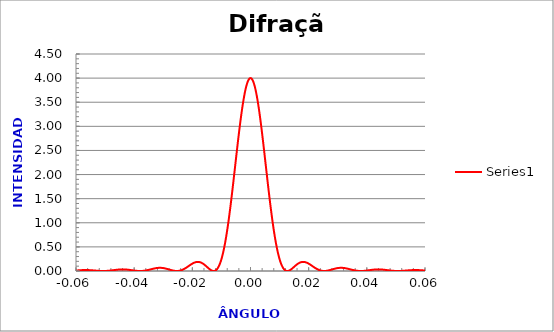
| Category | Series 0 |
|---|---|
| -0.1 | 0.001 |
| -0.09995 | 0.001 |
| -0.0999 | 0.001 |
| -0.09985 | 0.001 |
| -0.0998 | 0.001 |
| -0.09975 | 0.001 |
| -0.0997 | 0.001 |
| -0.0996499999999999 | 0.001 |
| -0.0995999999999999 | 0.001 |
| -0.0995499999999999 | 0.001 |
| -0.0994999999999999 | 0.001 |
| -0.0994499999999999 | 0.001 |
| -0.0993999999999999 | 0.002 |
| -0.0993499999999999 | 0.002 |
| -0.0992999999999999 | 0.002 |
| -0.0992499999999999 | 0.002 |
| -0.0991999999999999 | 0.002 |
| -0.0991499999999999 | 0.002 |
| -0.0990999999999999 | 0.002 |
| -0.0990499999999998 | 0.002 |
| -0.0989999999999998 | 0.002 |
| -0.0989499999999998 | 0.002 |
| -0.0988999999999998 | 0.002 |
| -0.0988499999999998 | 0.002 |
| -0.0987999999999998 | 0.002 |
| -0.0987499999999998 | 0.003 |
| -0.0986999999999998 | 0.003 |
| -0.0986499999999998 | 0.003 |
| -0.0985999999999998 | 0.003 |
| -0.0985499999999998 | 0.003 |
| -0.0984999999999998 | 0.003 |
| -0.0984499999999997 | 0.003 |
| -0.0983999999999997 | 0.003 |
| -0.0983499999999997 | 0.003 |
| -0.0982999999999997 | 0.003 |
| -0.0982499999999997 | 0.003 |
| -0.0981999999999997 | 0.004 |
| -0.0981499999999997 | 0.004 |
| -0.0980999999999997 | 0.004 |
| -0.0980499999999997 | 0.004 |
| -0.0979999999999997 | 0.004 |
| -0.0979499999999997 | 0.004 |
| -0.0978999999999997 | 0.004 |
| -0.0978499999999996 | 0.004 |
| -0.0977999999999996 | 0.004 |
| -0.0977499999999996 | 0.004 |
| -0.0976999999999996 | 0.004 |
| -0.0976499999999996 | 0.004 |
| -0.0975999999999996 | 0.005 |
| -0.0975499999999996 | 0.005 |
| -0.0974999999999996 | 0.005 |
| -0.0974499999999996 | 0.005 |
| -0.0973999999999996 | 0.005 |
| -0.0973499999999996 | 0.005 |
| -0.0972999999999996 | 0.005 |
| -0.0972499999999995 | 0.005 |
| -0.0971999999999995 | 0.005 |
| -0.0971499999999995 | 0.005 |
| -0.0970999999999995 | 0.005 |
| -0.0970499999999995 | 0.005 |
| -0.0969999999999995 | 0.005 |
| -0.0969499999999995 | 0.006 |
| -0.0968999999999995 | 0.006 |
| -0.0968499999999995 | 0.006 |
| -0.0967999999999995 | 0.006 |
| -0.0967499999999995 | 0.006 |
| -0.0966999999999995 | 0.006 |
| -0.0966499999999994 | 0.006 |
| -0.0965999999999994 | 0.006 |
| -0.0965499999999994 | 0.006 |
| -0.0964999999999994 | 0.006 |
| -0.0964499999999994 | 0.006 |
| -0.0963999999999994 | 0.006 |
| -0.0963499999999994 | 0.006 |
| -0.0962999999999994 | 0.006 |
| -0.0962499999999994 | 0.006 |
| -0.0961999999999994 | 0.007 |
| -0.0961499999999994 | 0.007 |
| -0.0960999999999994 | 0.007 |
| -0.0960499999999993 | 0.007 |
| -0.0959999999999993 | 0.007 |
| -0.0959499999999993 | 0.007 |
| -0.0958999999999993 | 0.007 |
| -0.0958499999999993 | 0.007 |
| -0.0957999999999993 | 0.007 |
| -0.0957499999999993 | 0.007 |
| -0.0956999999999993 | 0.007 |
| -0.0956499999999993 | 0.007 |
| -0.0955999999999993 | 0.007 |
| -0.0955499999999993 | 0.007 |
| -0.0954999999999993 | 0.007 |
| -0.0954499999999992 | 0.007 |
| -0.0953999999999992 | 0.007 |
| -0.0953499999999992 | 0.007 |
| -0.0952999999999992 | 0.007 |
| -0.0952499999999992 | 0.007 |
| -0.0951999999999992 | 0.007 |
| -0.0951499999999992 | 0.007 |
| -0.0950999999999992 | 0.007 |
| -0.0950499999999992 | 0.007 |
| -0.0949999999999992 | 0.007 |
| -0.0949499999999992 | 0.007 |
| -0.0948999999999992 | 0.007 |
| -0.0948499999999991 | 0.007 |
| -0.0947999999999991 | 0.007 |
| -0.0947499999999991 | 0.007 |
| -0.0946999999999991 | 0.007 |
| -0.0946499999999991 | 0.007 |
| -0.0945999999999991 | 0.007 |
| -0.0945499999999991 | 0.007 |
| -0.0944999999999991 | 0.007 |
| -0.0944499999999991 | 0.007 |
| -0.0943999999999991 | 0.007 |
| -0.0943499999999991 | 0.007 |
| -0.0942999999999991 | 0.007 |
| -0.094249999999999 | 0.007 |
| -0.094199999999999 | 0.007 |
| -0.094149999999999 | 0.007 |
| -0.094099999999999 | 0.007 |
| -0.094049999999999 | 0.007 |
| -0.093999999999999 | 0.007 |
| -0.093949999999999 | 0.007 |
| -0.093899999999999 | 0.007 |
| -0.093849999999999 | 0.007 |
| -0.093799999999999 | 0.007 |
| -0.093749999999999 | 0.007 |
| -0.093699999999999 | 0.007 |
| -0.0936499999999989 | 0.007 |
| -0.0935999999999989 | 0.006 |
| -0.0935499999999989 | 0.006 |
| -0.0934999999999989 | 0.006 |
| -0.0934499999999989 | 0.006 |
| -0.0933999999999989 | 0.006 |
| -0.0933499999999989 | 0.006 |
| -0.0932999999999989 | 0.006 |
| -0.0932499999999989 | 0.006 |
| -0.0931999999999989 | 0.006 |
| -0.0931499999999989 | 0.006 |
| -0.0930999999999989 | 0.006 |
| -0.0930499999999988 | 0.006 |
| -0.0929999999999988 | 0.006 |
| -0.0929499999999988 | 0.006 |
| -0.0928999999999988 | 0.006 |
| -0.0928499999999988 | 0.005 |
| -0.0927999999999988 | 0.005 |
| -0.0927499999999988 | 0.005 |
| -0.0926999999999988 | 0.005 |
| -0.0926499999999988 | 0.005 |
| -0.0925999999999988 | 0.005 |
| -0.0925499999999988 | 0.005 |
| -0.0924999999999987 | 0.005 |
| -0.0924499999999987 | 0.005 |
| -0.0923999999999987 | 0.005 |
| -0.0923499999999987 | 0.005 |
| -0.0922999999999987 | 0.005 |
| -0.0922499999999987 | 0.004 |
| -0.0921999999999987 | 0.004 |
| -0.0921499999999987 | 0.004 |
| -0.0920999999999987 | 0.004 |
| -0.0920499999999987 | 0.004 |
| -0.0919999999999987 | 0.004 |
| -0.0919499999999987 | 0.004 |
| -0.0918999999999986 | 0.004 |
| -0.0918499999999986 | 0.004 |
| -0.0917999999999986 | 0.004 |
| -0.0917499999999986 | 0.004 |
| -0.0916999999999986 | 0.003 |
| -0.0916499999999986 | 0.003 |
| -0.0915999999999986 | 0.003 |
| -0.0915499999999986 | 0.003 |
| -0.0914999999999986 | 0.003 |
| -0.0914499999999986 | 0.003 |
| -0.0913999999999986 | 0.003 |
| -0.0913499999999986 | 0.003 |
| -0.0912999999999985 | 0.003 |
| -0.0912499999999985 | 0.003 |
| -0.0911999999999985 | 0.003 |
| -0.0911499999999985 | 0.002 |
| -0.0910999999999985 | 0.002 |
| -0.0910499999999985 | 0.002 |
| -0.0909999999999985 | 0.002 |
| -0.0909499999999985 | 0.002 |
| -0.0908999999999985 | 0.002 |
| -0.0908499999999985 | 0.002 |
| -0.0907999999999985 | 0.002 |
| -0.0907499999999985 | 0.002 |
| -0.0906999999999984 | 0.002 |
| -0.0906499999999984 | 0.002 |
| -0.0905999999999984 | 0.002 |
| -0.0905499999999984 | 0.001 |
| -0.0904999999999984 | 0.001 |
| -0.0904499999999984 | 0.001 |
| -0.0903999999999984 | 0.001 |
| -0.0903499999999984 | 0.001 |
| -0.0902999999999984 | 0.001 |
| -0.0902499999999984 | 0.001 |
| -0.0901999999999984 | 0.001 |
| -0.0901499999999984 | 0.001 |
| -0.0900999999999983 | 0.001 |
| -0.0900499999999983 | 0.001 |
| -0.0899999999999983 | 0.001 |
| -0.0899499999999983 | 0.001 |
| -0.0898999999999983 | 0.001 |
| -0.0898499999999983 | 0.001 |
| -0.0897999999999983 | 0.001 |
| -0.0897499999999983 | 0 |
| -0.0896999999999983 | 0 |
| -0.0896499999999983 | 0 |
| -0.0895999999999983 | 0 |
| -0.0895499999999983 | 0 |
| -0.0894999999999982 | 0 |
| -0.0894499999999982 | 0 |
| -0.0893999999999982 | 0 |
| -0.0893499999999982 | 0 |
| -0.0892999999999982 | 0 |
| -0.0892499999999982 | 0 |
| -0.0891999999999982 | 0 |
| -0.0891499999999982 | 0 |
| -0.0890999999999982 | 0 |
| -0.0890499999999982 | 0 |
| -0.0889999999999982 | 0 |
| -0.0889499999999981 | 0 |
| -0.0888999999999981 | 0 |
| -0.0888499999999981 | 0 |
| -0.0887999999999981 | 0 |
| -0.0887499999999981 | 0 |
| -0.0886999999999981 | 0 |
| -0.0886499999999981 | 0 |
| -0.0885999999999981 | 0 |
| -0.0885499999999981 | 0 |
| -0.0884999999999981 | 0 |
| -0.0884499999999981 | 0 |
| -0.0883999999999981 | 0 |
| -0.088349999999998 | 0 |
| -0.088299999999998 | 0 |
| -0.088249999999998 | 0 |
| -0.088199999999998 | 0 |
| -0.088149999999998 | 0 |
| -0.088099999999998 | 0 |
| -0.088049999999998 | 0 |
| -0.087999999999998 | 0 |
| -0.087949999999998 | 0 |
| -0.087899999999998 | 0 |
| -0.087849999999998 | 0 |
| -0.087799999999998 | 0 |
| -0.0877499999999979 | 0 |
| -0.0876999999999979 | 0.001 |
| -0.0876499999999979 | 0.001 |
| -0.0875999999999979 | 0.001 |
| -0.0875499999999979 | 0.001 |
| -0.0874999999999979 | 0.001 |
| -0.0874499999999979 | 0.001 |
| -0.0873999999999979 | 0.001 |
| -0.0873499999999979 | 0.001 |
| -0.0872999999999979 | 0.001 |
| -0.0872499999999979 | 0.001 |
| -0.0871999999999979 | 0.001 |
| -0.0871499999999978 | 0.001 |
| -0.0870999999999978 | 0.001 |
| -0.0870499999999978 | 0.001 |
| -0.0869999999999978 | 0.001 |
| -0.0869499999999978 | 0.002 |
| -0.0868999999999978 | 0.002 |
| -0.0868499999999978 | 0.002 |
| -0.0867999999999978 | 0.002 |
| -0.0867499999999978 | 0.002 |
| -0.0866999999999978 | 0.002 |
| -0.0866499999999978 | 0.002 |
| -0.0865999999999978 | 0.002 |
| -0.0865499999999977 | 0.002 |
| -0.0864999999999977 | 0.002 |
| -0.0864499999999977 | 0.002 |
| -0.0863999999999977 | 0.003 |
| -0.0863499999999977 | 0.003 |
| -0.0862999999999977 | 0.003 |
| -0.0862499999999977 | 0.003 |
| -0.0861999999999977 | 0.003 |
| -0.0861499999999977 | 0.003 |
| -0.0860999999999977 | 0.003 |
| -0.0860499999999977 | 0.003 |
| -0.0859999999999977 | 0.003 |
| -0.0859499999999976 | 0.004 |
| -0.0858999999999976 | 0.004 |
| -0.0858499999999976 | 0.004 |
| -0.0857999999999976 | 0.004 |
| -0.0857499999999976 | 0.004 |
| -0.0856999999999976 | 0.004 |
| -0.0856499999999976 | 0.004 |
| -0.0855999999999976 | 0.004 |
| -0.0855499999999976 | 0.004 |
| -0.0854999999999976 | 0.005 |
| -0.0854499999999976 | 0.005 |
| -0.0853999999999976 | 0.005 |
| -0.0853499999999975 | 0.005 |
| -0.0852999999999975 | 0.005 |
| -0.0852499999999975 | 0.005 |
| -0.0851999999999975 | 0.005 |
| -0.0851499999999975 | 0.005 |
| -0.0850999999999975 | 0.006 |
| -0.0850499999999975 | 0.006 |
| -0.0849999999999975 | 0.006 |
| -0.0849499999999975 | 0.006 |
| -0.0848999999999975 | 0.006 |
| -0.0848499999999975 | 0.006 |
| -0.0847999999999975 | 0.006 |
| -0.0847499999999974 | 0.006 |
| -0.0846999999999974 | 0.006 |
| -0.0846499999999974 | 0.007 |
| -0.0845999999999974 | 0.007 |
| -0.0845499999999974 | 0.007 |
| -0.0844999999999974 | 0.007 |
| -0.0844499999999974 | 0.007 |
| -0.0843999999999974 | 0.007 |
| -0.0843499999999974 | 0.007 |
| -0.0842999999999974 | 0.007 |
| -0.0842499999999974 | 0.007 |
| -0.0841999999999974 | 0.007 |
| -0.0841499999999973 | 0.008 |
| -0.0840999999999973 | 0.008 |
| -0.0840499999999973 | 0.008 |
| -0.0839999999999973 | 0.008 |
| -0.0839499999999973 | 0.008 |
| -0.0838999999999973 | 0.008 |
| -0.0838499999999973 | 0.008 |
| -0.0837999999999973 | 0.008 |
| -0.0837499999999973 | 0.008 |
| -0.0836999999999973 | 0.008 |
| -0.0836499999999973 | 0.008 |
| -0.0835999999999973 | 0.008 |
| -0.0835499999999972 | 0.009 |
| -0.0834999999999972 | 0.009 |
| -0.0834499999999972 | 0.009 |
| -0.0833999999999972 | 0.009 |
| -0.0833499999999972 | 0.009 |
| -0.0832999999999972 | 0.009 |
| -0.0832499999999972 | 0.009 |
| -0.0831999999999972 | 0.009 |
| -0.0831499999999972 | 0.009 |
| -0.0830999999999972 | 0.009 |
| -0.0830499999999972 | 0.009 |
| -0.0829999999999972 | 0.009 |
| -0.0829499999999971 | 0.009 |
| -0.0828999999999971 | 0.009 |
| -0.0828499999999971 | 0.009 |
| -0.0827999999999971 | 0.009 |
| -0.0827499999999971 | 0.009 |
| -0.0826999999999971 | 0.009 |
| -0.0826499999999971 | 0.009 |
| -0.0825999999999971 | 0.01 |
| -0.0825499999999971 | 0.01 |
| -0.0824999999999971 | 0.01 |
| -0.0824499999999971 | 0.01 |
| -0.0823999999999971 | 0.01 |
| -0.082349999999997 | 0.01 |
| -0.082299999999997 | 0.01 |
| -0.082249999999997 | 0.01 |
| -0.082199999999997 | 0.01 |
| -0.082149999999997 | 0.01 |
| -0.082099999999997 | 0.01 |
| -0.082049999999997 | 0.01 |
| -0.081999999999997 | 0.01 |
| -0.081949999999997 | 0.01 |
| -0.081899999999997 | 0.01 |
| -0.081849999999997 | 0.01 |
| -0.081799999999997 | 0.01 |
| -0.0817499999999969 | 0.01 |
| -0.0816999999999969 | 0.009 |
| -0.0816499999999969 | 0.009 |
| -0.0815999999999969 | 0.009 |
| -0.0815499999999969 | 0.009 |
| -0.0814999999999969 | 0.009 |
| -0.0814499999999969 | 0.009 |
| -0.0813999999999969 | 0.009 |
| -0.0813499999999969 | 0.009 |
| -0.0812999999999969 | 0.009 |
| -0.0812499999999969 | 0.009 |
| -0.0811999999999969 | 0.009 |
| -0.0811499999999968 | 0.009 |
| -0.0810999999999968 | 0.009 |
| -0.0810499999999968 | 0.009 |
| -0.0809999999999968 | 0.009 |
| -0.0809499999999968 | 0.009 |
| -0.0808999999999968 | 0.009 |
| -0.0808499999999968 | 0.009 |
| -0.0807999999999968 | 0.009 |
| -0.0807499999999968 | 0.008 |
| -0.0806999999999968 | 0.008 |
| -0.0806499999999968 | 0.008 |
| -0.0805999999999968 | 0.008 |
| -0.0805499999999967 | 0.008 |
| -0.0804999999999967 | 0.008 |
| -0.0804499999999967 | 0.008 |
| -0.0803999999999967 | 0.008 |
| -0.0803499999999967 | 0.008 |
| -0.0802999999999967 | 0.008 |
| -0.0802499999999967 | 0.008 |
| -0.0801999999999967 | 0.007 |
| -0.0801499999999967 | 0.007 |
| -0.0800999999999967 | 0.007 |
| -0.0800499999999967 | 0.007 |
| -0.0799999999999967 | 0.007 |
| -0.0799499999999966 | 0.007 |
| -0.0798999999999966 | 0.007 |
| -0.0798499999999966 | 0.007 |
| -0.0797999999999966 | 0.007 |
| -0.0797499999999966 | 0.006 |
| -0.0796999999999966 | 0.006 |
| -0.0796499999999966 | 0.006 |
| -0.0795999999999966 | 0.006 |
| -0.0795499999999966 | 0.006 |
| -0.0794999999999966 | 0.006 |
| -0.0794499999999966 | 0.006 |
| -0.0793999999999966 | 0.006 |
| -0.0793499999999965 | 0.006 |
| -0.0792999999999965 | 0.005 |
| -0.0792499999999965 | 0.005 |
| -0.0791999999999965 | 0.005 |
| -0.0791499999999965 | 0.005 |
| -0.0790999999999965 | 0.005 |
| -0.0790499999999965 | 0.005 |
| -0.0789999999999965 | 0.005 |
| -0.0789499999999965 | 0.005 |
| -0.0788999999999965 | 0.004 |
| -0.0788499999999965 | 0.004 |
| -0.0787999999999965 | 0.004 |
| -0.0787499999999964 | 0.004 |
| -0.0786999999999964 | 0.004 |
| -0.0786499999999964 | 0.004 |
| -0.0785999999999964 | 0.004 |
| -0.0785499999999964 | 0.004 |
| -0.0784999999999964 | 0.003 |
| -0.0784499999999964 | 0.003 |
| -0.0783999999999964 | 0.003 |
| -0.0783499999999964 | 0.003 |
| -0.0782999999999964 | 0.003 |
| -0.0782499999999964 | 0.003 |
| -0.0781999999999964 | 0.003 |
| -0.0781499999999963 | 0.003 |
| -0.0780999999999963 | 0.003 |
| -0.0780499999999963 | 0.002 |
| -0.0779999999999963 | 0.002 |
| -0.0779499999999963 | 0.002 |
| -0.0778999999999963 | 0.002 |
| -0.0778499999999963 | 0.002 |
| -0.0777999999999963 | 0.002 |
| -0.0777499999999963 | 0.002 |
| -0.0776999999999963 | 0.002 |
| -0.0776499999999963 | 0.002 |
| -0.0775999999999962 | 0.002 |
| -0.0775499999999962 | 0.001 |
| -0.0774999999999962 | 0.001 |
| -0.0774499999999962 | 0.001 |
| -0.0773999999999962 | 0.001 |
| -0.0773499999999962 | 0.001 |
| -0.0772999999999962 | 0.001 |
| -0.0772499999999962 | 0.001 |
| -0.0771999999999962 | 0.001 |
| -0.0771499999999962 | 0.001 |
| -0.0770999999999962 | 0.001 |
| -0.0770499999999962 | 0.001 |
| -0.0769999999999961 | 0.001 |
| -0.0769499999999961 | 0.001 |
| -0.0768999999999961 | 0 |
| -0.0768499999999961 | 0 |
| -0.0767999999999961 | 0 |
| -0.0767499999999961 | 0 |
| -0.0766999999999961 | 0 |
| -0.0766499999999961 | 0 |
| -0.0765999999999961 | 0 |
| -0.0765499999999961 | 0 |
| -0.0764999999999961 | 0 |
| -0.0764499999999961 | 0 |
| -0.076399999999996 | 0 |
| -0.076349999999996 | 0 |
| -0.076299999999996 | 0 |
| -0.076249999999996 | 0 |
| -0.076199999999996 | 0 |
| -0.076149999999996 | 0 |
| -0.076099999999996 | 0 |
| -0.076049999999996 | 0 |
| -0.075999999999996 | 0 |
| -0.075949999999996 | 0 |
| -0.075899999999996 | 0 |
| -0.075849999999996 | 0 |
| -0.0757999999999959 | 0 |
| -0.0757499999999959 | 0 |
| -0.0756999999999959 | 0 |
| -0.0756499999999959 | 0 |
| -0.0755999999999959 | 0 |
| -0.0755499999999959 | 0 |
| -0.0754999999999959 | 0 |
| -0.0754499999999959 | 0 |
| -0.0753999999999959 | 0 |
| -0.0753499999999959 | 0 |
| -0.0752999999999959 | 0 |
| -0.0752499999999959 | 0 |
| -0.0751999999999958 | 0 |
| -0.0751499999999958 | 0.001 |
| -0.0750999999999958 | 0.001 |
| -0.0750499999999958 | 0.001 |
| -0.0749999999999958 | 0.001 |
| -0.0749499999999958 | 0.001 |
| -0.0748999999999958 | 0.001 |
| -0.0748499999999958 | 0.001 |
| -0.0747999999999958 | 0.001 |
| -0.0747499999999958 | 0.001 |
| -0.0746999999999958 | 0.001 |
| -0.0746499999999958 | 0.001 |
| -0.0745999999999957 | 0.001 |
| -0.0745499999999957 | 0.002 |
| -0.0744999999999957 | 0.002 |
| -0.0744499999999957 | 0.002 |
| -0.0743999999999957 | 0.002 |
| -0.0743499999999957 | 0.002 |
| -0.0742999999999957 | 0.002 |
| -0.0742499999999957 | 0.002 |
| -0.0741999999999957 | 0.002 |
| -0.0741499999999957 | 0.002 |
| -0.0740999999999957 | 0.003 |
| -0.0740499999999957 | 0.003 |
| -0.0739999999999956 | 0.003 |
| -0.0739499999999956 | 0.003 |
| -0.0738999999999956 | 0.003 |
| -0.0738499999999956 | 0.003 |
| -0.0737999999999956 | 0.003 |
| -0.0737499999999956 | 0.003 |
| -0.0736999999999956 | 0.004 |
| -0.0736499999999956 | 0.004 |
| -0.0735999999999956 | 0.004 |
| -0.0735499999999956 | 0.004 |
| -0.0734999999999956 | 0.004 |
| -0.0734499999999956 | 0.004 |
| -0.0733999999999955 | 0.004 |
| -0.0733499999999955 | 0.005 |
| -0.0732999999999955 | 0.005 |
| -0.0732499999999955 | 0.005 |
| -0.0731999999999955 | 0.005 |
| -0.0731499999999955 | 0.005 |
| -0.0730999999999955 | 0.005 |
| -0.0730499999999955 | 0.006 |
| -0.0729999999999955 | 0.006 |
| -0.0729499999999955 | 0.006 |
| -0.0728999999999955 | 0.006 |
| -0.0728499999999955 | 0.006 |
| -0.0727999999999954 | 0.006 |
| -0.0727499999999954 | 0.006 |
| -0.0726999999999954 | 0.007 |
| -0.0726499999999954 | 0.007 |
| -0.0725999999999954 | 0.007 |
| -0.0725499999999954 | 0.007 |
| -0.0724999999999954 | 0.007 |
| -0.0724499999999954 | 0.007 |
| -0.0723999999999954 | 0.008 |
| -0.0723499999999954 | 0.008 |
| -0.0722999999999954 | 0.008 |
| -0.0722499999999954 | 0.008 |
| -0.0721999999999953 | 0.008 |
| -0.0721499999999953 | 0.008 |
| -0.0720999999999953 | 0.009 |
| -0.0720499999999953 | 0.009 |
| -0.0719999999999953 | 0.009 |
| -0.0719499999999953 | 0.009 |
| -0.0718999999999953 | 0.009 |
| -0.0718499999999953 | 0.009 |
| -0.0717999999999953 | 0.009 |
| -0.0717499999999953 | 0.01 |
| -0.0716999999999953 | 0.01 |
| -0.0716499999999953 | 0.01 |
| -0.0715999999999952 | 0.01 |
| -0.0715499999999952 | 0.01 |
| -0.0714999999999952 | 0.01 |
| -0.0714499999999952 | 0.01 |
| -0.0713999999999952 | 0.011 |
| -0.0713499999999952 | 0.011 |
| -0.0712999999999952 | 0.011 |
| -0.0712499999999952 | 0.011 |
| -0.0711999999999952 | 0.011 |
| -0.0711499999999952 | 0.011 |
| -0.0710999999999952 | 0.011 |
| -0.0710499999999952 | 0.011 |
| -0.0709999999999951 | 0.012 |
| -0.0709499999999951 | 0.012 |
| -0.0708999999999951 | 0.012 |
| -0.0708499999999951 | 0.012 |
| -0.0707999999999951 | 0.012 |
| -0.0707499999999951 | 0.012 |
| -0.0706999999999951 | 0.012 |
| -0.0706499999999951 | 0.012 |
| -0.0705999999999951 | 0.012 |
| -0.0705499999999951 | 0.012 |
| -0.0704999999999951 | 0.013 |
| -0.0704499999999951 | 0.013 |
| -0.070399999999995 | 0.013 |
| -0.070349999999995 | 0.013 |
| -0.070299999999995 | 0.013 |
| -0.070249999999995 | 0.013 |
| -0.070199999999995 | 0.013 |
| -0.070149999999995 | 0.013 |
| -0.070099999999995 | 0.013 |
| -0.070049999999995 | 0.013 |
| -0.069999999999995 | 0.013 |
| -0.069949999999995 | 0.013 |
| -0.069899999999995 | 0.013 |
| -0.069849999999995 | 0.013 |
| -0.0697999999999949 | 0.013 |
| -0.0697499999999949 | 0.013 |
| -0.0696999999999949 | 0.013 |
| -0.0696499999999949 | 0.013 |
| -0.0695999999999949 | 0.013 |
| -0.0695499999999949 | 0.013 |
| -0.0694999999999949 | 0.013 |
| -0.0694499999999949 | 0.013 |
| -0.0693999999999949 | 0.013 |
| -0.0693499999999949 | 0.013 |
| -0.0692999999999949 | 0.013 |
| -0.0692499999999949 | 0.013 |
| -0.0691999999999948 | 0.013 |
| -0.0691499999999948 | 0.013 |
| -0.0690999999999948 | 0.013 |
| -0.0690499999999948 | 0.013 |
| -0.0689999999999948 | 0.013 |
| -0.0689499999999948 | 0.013 |
| -0.0688999999999948 | 0.013 |
| -0.0688499999999948 | 0.013 |
| -0.0687999999999948 | 0.013 |
| -0.0687499999999948 | 0.013 |
| -0.0686999999999948 | 0.013 |
| -0.0686499999999948 | 0.013 |
| -0.0685999999999947 | 0.013 |
| -0.0685499999999947 | 0.013 |
| -0.0684999999999947 | 0.013 |
| -0.0684499999999947 | 0.013 |
| -0.0683999999999947 | 0.013 |
| -0.0683499999999947 | 0.012 |
| -0.0682999999999947 | 0.012 |
| -0.0682499999999947 | 0.012 |
| -0.0681999999999947 | 0.012 |
| -0.0681499999999947 | 0.012 |
| -0.0680999999999947 | 0.012 |
| -0.0680499999999947 | 0.012 |
| -0.0679999999999946 | 0.012 |
| -0.0679499999999946 | 0.012 |
| -0.0678999999999946 | 0.012 |
| -0.0678499999999946 | 0.011 |
| -0.0677999999999946 | 0.011 |
| -0.0677499999999946 | 0.011 |
| -0.0676999999999946 | 0.011 |
| -0.0676499999999946 | 0.011 |
| -0.0675999999999946 | 0.011 |
| -0.0675499999999946 | 0.011 |
| -0.0674999999999946 | 0.01 |
| -0.0674499999999946 | 0.01 |
| -0.0673999999999945 | 0.01 |
| -0.0673499999999945 | 0.01 |
| -0.0672999999999945 | 0.01 |
| -0.0672499999999945 | 0.01 |
| -0.0671999999999945 | 0.01 |
| -0.0671499999999945 | 0.009 |
| -0.0670999999999945 | 0.009 |
| -0.0670499999999945 | 0.009 |
| -0.0669999999999945 | 0.009 |
| -0.0669499999999945 | 0.009 |
| -0.0668999999999945 | 0.009 |
| -0.0668499999999944 | 0.008 |
| -0.0667999999999944 | 0.008 |
| -0.0667499999999944 | 0.008 |
| -0.0666999999999944 | 0.008 |
| -0.0666499999999944 | 0.008 |
| -0.0665999999999944 | 0.008 |
| -0.0665499999999944 | 0.007 |
| -0.0664999999999944 | 0.007 |
| -0.0664499999999944 | 0.007 |
| -0.0663999999999944 | 0.007 |
| -0.0663499999999944 | 0.007 |
| -0.0662999999999944 | 0.007 |
| -0.0662499999999943 | 0.006 |
| -0.0661999999999943 | 0.006 |
| -0.0661499999999943 | 0.006 |
| -0.0660999999999943 | 0.006 |
| -0.0660499999999943 | 0.006 |
| -0.0659999999999943 | 0.006 |
| -0.0659499999999943 | 0.005 |
| -0.0658999999999943 | 0.005 |
| -0.0658499999999943 | 0.005 |
| -0.0657999999999943 | 0.005 |
| -0.0657499999999943 | 0.005 |
| -0.0656999999999943 | 0.005 |
| -0.0656499999999942 | 0.004 |
| -0.0655999999999942 | 0.004 |
| -0.0655499999999942 | 0.004 |
| -0.0654999999999942 | 0.004 |
| -0.0654499999999942 | 0.004 |
| -0.0653999999999942 | 0.004 |
| -0.0653499999999942 | 0.003 |
| -0.0652999999999942 | 0.003 |
| -0.0652499999999942 | 0.003 |
| -0.0651999999999942 | 0.003 |
| -0.0651499999999942 | 0.003 |
| -0.0650999999999942 | 0.003 |
| -0.0650499999999941 | 0.003 |
| -0.0649999999999941 | 0.002 |
| -0.0649499999999941 | 0.002 |
| -0.0648999999999941 | 0.002 |
| -0.0648499999999941 | 0.002 |
| -0.0647999999999941 | 0.002 |
| -0.0647499999999941 | 0.002 |
| -0.0646999999999941 | 0.002 |
| -0.0646499999999941 | 0.002 |
| -0.0645999999999941 | 0.001 |
| -0.0645499999999941 | 0.001 |
| -0.0644999999999941 | 0.001 |
| -0.064449999999994 | 0.001 |
| -0.064399999999994 | 0.001 |
| -0.064349999999994 | 0.001 |
| -0.064299999999994 | 0.001 |
| -0.064249999999994 | 0.001 |
| -0.064199999999994 | 0.001 |
| -0.064149999999994 | 0.001 |
| -0.064099999999994 | 0.001 |
| -0.064049999999994 | 0 |
| -0.063999999999994 | 0 |
| -0.063949999999994 | 0 |
| -0.063899999999994 | 0 |
| -0.0638499999999939 | 0 |
| -0.0637999999999939 | 0 |
| -0.0637499999999939 | 0 |
| -0.0636999999999939 | 0 |
| -0.0636499999999939 | 0 |
| -0.0635999999999939 | 0 |
| -0.0635499999999939 | 0 |
| -0.0634999999999939 | 0 |
| -0.0634499999999939 | 0 |
| -0.0633999999999939 | 0 |
| -0.0633499999999939 | 0 |
| -0.0632999999999939 | 0 |
| -0.0632499999999938 | 0 |
| -0.0631999999999938 | 0 |
| -0.0631499999999938 | 0 |
| -0.0630999999999938 | 0 |
| -0.0630499999999938 | 0 |
| -0.0629999999999938 | 0 |
| -0.0629499999999938 | 0 |
| -0.0628999999999938 | 0 |
| -0.0628499999999938 | 0 |
| -0.0627999999999938 | 0 |
| -0.0627499999999938 | 0 |
| -0.0626999999999938 | 0 |
| -0.0626499999999937 | 0 |
| -0.0625999999999937 | 0.001 |
| -0.0625499999999937 | 0.001 |
| -0.0624999999999937 | 0.001 |
| -0.0624499999999937 | 0.001 |
| -0.0623999999999937 | 0.001 |
| -0.0623499999999937 | 0.001 |
| -0.0622999999999937 | 0.001 |
| -0.0622499999999937 | 0.001 |
| -0.0621999999999937 | 0.001 |
| -0.0621499999999937 | 0.001 |
| -0.0620999999999937 | 0.002 |
| -0.0620499999999936 | 0.002 |
| -0.0619999999999936 | 0.002 |
| -0.0619499999999936 | 0.002 |
| -0.0618999999999936 | 0.002 |
| -0.0618499999999936 | 0.002 |
| -0.0617999999999936 | 0.002 |
| -0.0617499999999936 | 0.003 |
| -0.0616999999999936 | 0.003 |
| -0.0616499999999936 | 0.003 |
| -0.0615999999999936 | 0.003 |
| -0.0615499999999936 | 0.003 |
| -0.0614999999999936 | 0.003 |
| -0.0614499999999935 | 0.004 |
| -0.0613999999999935 | 0.004 |
| -0.0613499999999935 | 0.004 |
| -0.0612999999999935 | 0.004 |
| -0.0612499999999935 | 0.004 |
| -0.0611999999999935 | 0.004 |
| -0.0611499999999935 | 0.005 |
| -0.0610999999999935 | 0.005 |
| -0.0610499999999935 | 0.005 |
| -0.0609999999999935 | 0.005 |
| -0.0609499999999935 | 0.005 |
| -0.0608999999999935 | 0.006 |
| -0.0608499999999934 | 0.006 |
| -0.0607999999999934 | 0.006 |
| -0.0607499999999934 | 0.006 |
| -0.0606999999999934 | 0.007 |
| -0.0606499999999934 | 0.007 |
| -0.0605999999999934 | 0.007 |
| -0.0605499999999934 | 0.007 |
| -0.0604999999999934 | 0.007 |
| -0.0604499999999934 | 0.008 |
| -0.0603999999999934 | 0.008 |
| -0.0603499999999934 | 0.008 |
| -0.0602999999999934 | 0.008 |
| -0.0602499999999933 | 0.009 |
| -0.0601999999999933 | 0.009 |
| -0.0601499999999933 | 0.009 |
| -0.0600999999999933 | 0.009 |
| -0.0600499999999933 | 0.01 |
| -0.0599999999999933 | 0.01 |
| -0.0599499999999933 | 0.01 |
| -0.0598999999999933 | 0.01 |
| -0.0598499999999933 | 0.011 |
| -0.0597999999999933 | 0.011 |
| -0.0597499999999933 | 0.011 |
| -0.0596999999999933 | 0.011 |
| -0.0596499999999932 | 0.011 |
| -0.0595999999999932 | 0.012 |
| -0.0595499999999932 | 0.012 |
| -0.0594999999999932 | 0.012 |
| -0.0594499999999932 | 0.012 |
| -0.0593999999999932 | 0.013 |
| -0.0593499999999932 | 0.013 |
| -0.0592999999999932 | 0.013 |
| -0.0592499999999932 | 0.013 |
| -0.0591999999999932 | 0.014 |
| -0.0591499999999932 | 0.014 |
| -0.0590999999999932 | 0.014 |
| -0.0590499999999931 | 0.014 |
| -0.0589999999999931 | 0.014 |
| -0.0589499999999931 | 0.015 |
| -0.0588999999999931 | 0.015 |
| -0.0588499999999931 | 0.015 |
| -0.0587999999999931 | 0.015 |
| -0.0587499999999931 | 0.016 |
| -0.0586999999999931 | 0.016 |
| -0.0586499999999931 | 0.016 |
| -0.0585999999999931 | 0.016 |
| -0.0585499999999931 | 0.016 |
| -0.0584999999999931 | 0.016 |
| -0.058449999999993 | 0.017 |
| -0.058399999999993 | 0.017 |
| -0.058349999999993 | 0.017 |
| -0.058299999999993 | 0.017 |
| -0.058249999999993 | 0.017 |
| -0.058199999999993 | 0.018 |
| -0.058149999999993 | 0.018 |
| -0.058099999999993 | 0.018 |
| -0.058049999999993 | 0.018 |
| -0.057999999999993 | 0.018 |
| -0.057949999999993 | 0.018 |
| -0.057899999999993 | 0.018 |
| -0.0578499999999929 | 0.019 |
| -0.0577999999999929 | 0.019 |
| -0.0577499999999929 | 0.019 |
| -0.0576999999999929 | 0.019 |
| -0.0576499999999929 | 0.019 |
| -0.0575999999999929 | 0.019 |
| -0.0575499999999929 | 0.019 |
| -0.0574999999999929 | 0.019 |
| -0.0574499999999929 | 0.019 |
| -0.0573999999999929 | 0.02 |
| -0.0573499999999929 | 0.02 |
| -0.0572999999999929 | 0.02 |
| -0.0572499999999928 | 0.02 |
| -0.0571999999999928 | 0.02 |
| -0.0571499999999928 | 0.02 |
| -0.0570999999999928 | 0.02 |
| -0.0570499999999928 | 0.02 |
| -0.0569999999999928 | 0.02 |
| -0.0569499999999928 | 0.02 |
| -0.0568999999999928 | 0.02 |
| -0.0568499999999928 | 0.02 |
| -0.0567999999999928 | 0.02 |
| -0.0567499999999928 | 0.02 |
| -0.0566999999999928 | 0.02 |
| -0.0566499999999927 | 0.02 |
| -0.0565999999999927 | 0.02 |
| -0.0565499999999927 | 0.02 |
| -0.0564999999999927 | 0.02 |
| -0.0564499999999927 | 0.02 |
| -0.0563999999999927 | 0.02 |
| -0.0563499999999927 | 0.02 |
| -0.0562999999999927 | 0.02 |
| -0.0562499999999927 | 0.02 |
| -0.0561999999999927 | 0.02 |
| -0.0561499999999927 | 0.02 |
| -0.0560999999999927 | 0.02 |
| -0.0560499999999926 | 0.02 |
| -0.0559999999999926 | 0.019 |
| -0.0559499999999926 | 0.019 |
| -0.0558999999999926 | 0.019 |
| -0.0558499999999926 | 0.019 |
| -0.0557999999999926 | 0.019 |
| -0.0557499999999926 | 0.019 |
| -0.0556999999999926 | 0.019 |
| -0.0556499999999926 | 0.019 |
| -0.0555999999999926 | 0.019 |
| -0.0555499999999926 | 0.018 |
| -0.0554999999999925 | 0.018 |
| -0.0554499999999925 | 0.018 |
| -0.0553999999999925 | 0.018 |
| -0.0553499999999925 | 0.018 |
| -0.0552999999999925 | 0.018 |
| -0.0552499999999925 | 0.018 |
| -0.0551999999999925 | 0.017 |
| -0.0551499999999925 | 0.017 |
| -0.0550999999999925 | 0.017 |
| -0.0550499999999925 | 0.017 |
| -0.0549999999999925 | 0.017 |
| -0.0549499999999925 | 0.016 |
| -0.0548999999999924 | 0.016 |
| -0.0548499999999924 | 0.016 |
| -0.0547999999999924 | 0.016 |
| -0.0547499999999924 | 0.016 |
| -0.0546999999999924 | 0.015 |
| -0.0546499999999924 | 0.015 |
| -0.0545999999999924 | 0.015 |
| -0.0545499999999924 | 0.015 |
| -0.0544999999999924 | 0.015 |
| -0.0544499999999924 | 0.014 |
| -0.0543999999999924 | 0.014 |
| -0.0543499999999924 | 0.014 |
| -0.0542999999999923 | 0.014 |
| -0.0542499999999923 | 0.013 |
| -0.0541999999999923 | 0.013 |
| -0.0541499999999923 | 0.013 |
| -0.0540999999999923 | 0.013 |
| -0.0540499999999923 | 0.012 |
| -0.0539999999999923 | 0.012 |
| -0.0539499999999923 | 0.012 |
| -0.0538999999999923 | 0.012 |
| -0.0538499999999923 | 0.011 |
| -0.0537999999999923 | 0.011 |
| -0.0537499999999923 | 0.011 |
| -0.0536999999999922 | 0.011 |
| -0.0536499999999922 | 0.01 |
| -0.0535999999999922 | 0.01 |
| -0.0535499999999922 | 0.01 |
| -0.0534999999999922 | 0.01 |
| -0.0534499999999922 | 0.009 |
| -0.0533999999999922 | 0.009 |
| -0.0533499999999922 | 0.009 |
| -0.0532999999999922 | 0.008 |
| -0.0532499999999922 | 0.008 |
| -0.0531999999999922 | 0.008 |
| -0.0531499999999922 | 0.008 |
| -0.0530999999999921 | 0.007 |
| -0.0530499999999921 | 0.007 |
| -0.0529999999999921 | 0.007 |
| -0.0529499999999921 | 0.007 |
| -0.0528999999999921 | 0.006 |
| -0.0528499999999921 | 0.006 |
| -0.0527999999999921 | 0.006 |
| -0.0527499999999921 | 0.006 |
| -0.0526999999999921 | 0.005 |
| -0.0526499999999921 | 0.005 |
| -0.0525999999999921 | 0.005 |
| -0.0525499999999921 | 0.005 |
| -0.052499999999992 | 0.005 |
| -0.052449999999992 | 0.004 |
| -0.052399999999992 | 0.004 |
| -0.052349999999992 | 0.004 |
| -0.052299999999992 | 0.004 |
| -0.052249999999992 | 0.004 |
| -0.052199999999992 | 0.003 |
| -0.052149999999992 | 0.003 |
| -0.052099999999992 | 0.003 |
| -0.052049999999992 | 0.003 |
| -0.051999999999992 | 0.003 |
| -0.051949999999992 | 0.002 |
| -0.0518999999999919 | 0.002 |
| -0.0518499999999919 | 0.002 |
| -0.0517999999999919 | 0.002 |
| -0.0517499999999919 | 0.002 |
| -0.0516999999999919 | 0.002 |
| -0.0516499999999919 | 0.001 |
| -0.0515999999999919 | 0.001 |
| -0.0515499999999919 | 0.001 |
| -0.0514999999999919 | 0.001 |
| -0.0514499999999919 | 0.001 |
| -0.0513999999999919 | 0.001 |
| -0.0513499999999919 | 0.001 |
| -0.0512999999999918 | 0.001 |
| -0.0512499999999918 | 0.001 |
| -0.0511999999999918 | 0 |
| -0.0511499999999918 | 0 |
| -0.0510999999999918 | 0 |
| -0.0510499999999918 | 0 |
| -0.0509999999999918 | 0 |
| -0.0509499999999918 | 0 |
| -0.0508999999999918 | 0 |
| -0.0508499999999918 | 0 |
| -0.0507999999999918 | 0 |
| -0.0507499999999918 | 0 |
| -0.0506999999999917 | 0 |
| -0.0506499999999917 | 0 |
| -0.0505999999999917 | 0 |
| -0.0505499999999917 | 0 |
| -0.0504999999999917 | 0 |
| -0.0504499999999917 | 0 |
| -0.0503999999999917 | 0 |
| -0.0503499999999917 | 0 |
| -0.0502999999999917 | 0 |
| -0.0502499999999917 | 0 |
| -0.0501999999999917 | 0 |
| -0.0501499999999917 | 0 |
| -0.0500999999999916 | 0 |
| -0.0500499999999916 | 0.001 |
| -0.0499999999999916 | 0.001 |
| -0.0499499999999916 | 0.001 |
| -0.0498999999999916 | 0.001 |
| -0.0498499999999916 | 0.001 |
| -0.0497999999999916 | 0.001 |
| -0.0497499999999916 | 0.001 |
| -0.0496999999999916 | 0.001 |
| -0.0496499999999916 | 0.002 |
| -0.0495999999999916 | 0.002 |
| -0.0495499999999916 | 0.002 |
| -0.0494999999999915 | 0.002 |
| -0.0494499999999915 | 0.002 |
| -0.0493999999999915 | 0.003 |
| -0.0493499999999915 | 0.003 |
| -0.0492999999999915 | 0.003 |
| -0.0492499999999915 | 0.003 |
| -0.0491999999999915 | 0.003 |
| -0.0491499999999915 | 0.004 |
| -0.0490999999999915 | 0.004 |
| -0.0490499999999915 | 0.004 |
| -0.0489999999999915 | 0.004 |
| -0.0489499999999915 | 0.005 |
| -0.0488999999999914 | 0.005 |
| -0.0488499999999914 | 0.005 |
| -0.0487999999999914 | 0.005 |
| -0.0487499999999914 | 0.006 |
| -0.0486999999999914 | 0.006 |
| -0.0486499999999914 | 0.006 |
| -0.0485999999999914 | 0.007 |
| -0.0485499999999914 | 0.007 |
| -0.0484999999999914 | 0.007 |
| -0.0484499999999914 | 0.008 |
| -0.0483999999999914 | 0.008 |
| -0.0483499999999914 | 0.008 |
| -0.0482999999999913 | 0.009 |
| -0.0482499999999913 | 0.009 |
| -0.0481999999999913 | 0.009 |
| -0.0481499999999913 | 0.01 |
| -0.0480999999999913 | 0.01 |
| -0.0480499999999913 | 0.01 |
| -0.0479999999999913 | 0.011 |
| -0.0479499999999913 | 0.011 |
| -0.0478999999999913 | 0.011 |
| -0.0478499999999913 | 0.012 |
| -0.0477999999999913 | 0.012 |
| -0.0477499999999913 | 0.012 |
| -0.0476999999999912 | 0.013 |
| -0.0476499999999912 | 0.013 |
| -0.0475999999999912 | 0.014 |
| -0.0475499999999912 | 0.014 |
| -0.0474999999999912 | 0.014 |
| -0.0474499999999912 | 0.015 |
| -0.0473999999999912 | 0.015 |
| -0.0473499999999912 | 0.016 |
| -0.0472999999999912 | 0.016 |
| -0.0472499999999912 | 0.016 |
| -0.0471999999999912 | 0.017 |
| -0.0471499999999912 | 0.017 |
| -0.0470999999999911 | 0.017 |
| -0.0470499999999911 | 0.018 |
| -0.0469999999999911 | 0.018 |
| -0.0469499999999911 | 0.019 |
| -0.0468999999999911 | 0.019 |
| -0.0468499999999911 | 0.019 |
| -0.0467999999999911 | 0.02 |
| -0.0467499999999911 | 0.02 |
| -0.0466999999999911 | 0.021 |
| -0.0466499999999911 | 0.021 |
| -0.0465999999999911 | 0.021 |
| -0.0465499999999911 | 0.022 |
| -0.046499999999991 | 0.022 |
| -0.046449999999991 | 0.023 |
| -0.046399999999991 | 0.023 |
| -0.046349999999991 | 0.023 |
| -0.046299999999991 | 0.024 |
| -0.046249999999991 | 0.024 |
| -0.046199999999991 | 0.024 |
| -0.046149999999991 | 0.025 |
| -0.046099999999991 | 0.025 |
| -0.046049999999991 | 0.025 |
| -0.045999999999991 | 0.026 |
| -0.045949999999991 | 0.026 |
| -0.0458999999999909 | 0.026 |
| -0.0458499999999909 | 0.027 |
| -0.0457999999999909 | 0.027 |
| -0.0457499999999909 | 0.027 |
| -0.0456999999999909 | 0.028 |
| -0.0456499999999909 | 0.028 |
| -0.0455999999999909 | 0.028 |
| -0.0455499999999909 | 0.029 |
| -0.0454999999999909 | 0.029 |
| -0.0454499999999909 | 0.029 |
| -0.0453999999999909 | 0.029 |
| -0.0453499999999909 | 0.03 |
| -0.0452999999999908 | 0.03 |
| -0.0452499999999908 | 0.03 |
| -0.0451999999999908 | 0.03 |
| -0.0451499999999908 | 0.031 |
| -0.0450999999999908 | 0.031 |
| -0.0450499999999908 | 0.031 |
| -0.0449999999999908 | 0.031 |
| -0.0449499999999908 | 0.031 |
| -0.0448999999999908 | 0.032 |
| -0.0448499999999908 | 0.032 |
| -0.0447999999999908 | 0.032 |
| -0.0447499999999907 | 0.032 |
| -0.0446999999999907 | 0.032 |
| -0.0446499999999907 | 0.032 |
| -0.0445999999999907 | 0.033 |
| -0.0445499999999907 | 0.033 |
| -0.0444999999999907 | 0.033 |
| -0.0444499999999907 | 0.033 |
| -0.0443999999999907 | 0.033 |
| -0.0443499999999907 | 0.033 |
| -0.0442999999999907 | 0.033 |
| -0.0442499999999907 | 0.033 |
| -0.0441999999999907 | 0.033 |
| -0.0441499999999906 | 0.033 |
| -0.0440999999999906 | 0.033 |
| -0.0440499999999906 | 0.033 |
| -0.0439999999999906 | 0.033 |
| -0.0439499999999906 | 0.033 |
| -0.0438999999999906 | 0.033 |
| -0.0438499999999906 | 0.033 |
| -0.0437999999999906 | 0.033 |
| -0.0437499999999906 | 0.033 |
| -0.0436999999999906 | 0.033 |
| -0.0436499999999906 | 0.033 |
| -0.0435999999999906 | 0.033 |
| -0.0435499999999905 | 0.033 |
| -0.0434999999999905 | 0.033 |
| -0.0434499999999905 | 0.033 |
| -0.0433999999999905 | 0.033 |
| -0.0433499999999905 | 0.033 |
| -0.0432999999999905 | 0.032 |
| -0.0432499999999905 | 0.032 |
| -0.0431999999999905 | 0.032 |
| -0.0431499999999905 | 0.032 |
| -0.0430999999999905 | 0.032 |
| -0.0430499999999905 | 0.032 |
| -0.0429999999999905 | 0.031 |
| -0.0429499999999904 | 0.031 |
| -0.0428999999999904 | 0.031 |
| -0.0428499999999904 | 0.031 |
| -0.0427999999999904 | 0.031 |
| -0.0427499999999904 | 0.03 |
| -0.0426999999999904 | 0.03 |
| -0.0426499999999904 | 0.03 |
| -0.0425999999999904 | 0.03 |
| -0.0425499999999904 | 0.029 |
| -0.0424999999999904 | 0.029 |
| -0.0424499999999904 | 0.029 |
| -0.0423999999999904 | 0.029 |
| -0.0423499999999903 | 0.028 |
| -0.0422999999999903 | 0.028 |
| -0.0422499999999903 | 0.028 |
| -0.0421999999999903 | 0.027 |
| -0.0421499999999903 | 0.027 |
| -0.0420999999999903 | 0.027 |
| -0.0420499999999903 | 0.026 |
| -0.0419999999999903 | 0.026 |
| -0.0419499999999903 | 0.026 |
| -0.0418999999999903 | 0.025 |
| -0.0418499999999903 | 0.025 |
| -0.0417999999999903 | 0.024 |
| -0.0417499999999902 | 0.024 |
| -0.0416999999999902 | 0.024 |
| -0.0416499999999902 | 0.023 |
| -0.0415999999999902 | 0.023 |
| -0.0415499999999902 | 0.022 |
| -0.0414999999999902 | 0.022 |
| -0.0414499999999902 | 0.022 |
| -0.0413999999999902 | 0.021 |
| -0.0413499999999902 | 0.021 |
| -0.0412999999999902 | 0.02 |
| -0.0412499999999902 | 0.02 |
| -0.0411999999999902 | 0.02 |
| -0.0411499999999901 | 0.019 |
| -0.0410999999999901 | 0.019 |
| -0.0410499999999901 | 0.018 |
| -0.0409999999999901 | 0.018 |
| -0.0409499999999901 | 0.017 |
| -0.0408999999999901 | 0.017 |
| -0.0408499999999901 | 0.017 |
| -0.0407999999999901 | 0.016 |
| -0.0407499999999901 | 0.016 |
| -0.0406999999999901 | 0.015 |
| -0.0406499999999901 | 0.015 |
| -0.0405999999999901 | 0.014 |
| -0.04054999999999 | 0.014 |
| -0.04049999999999 | 0.013 |
| -0.04044999999999 | 0.013 |
| -0.04039999999999 | 0.013 |
| -0.04034999999999 | 0.012 |
| -0.04029999999999 | 0.012 |
| -0.04024999999999 | 0.011 |
| -0.04019999999999 | 0.011 |
| -0.04014999999999 | 0.011 |
| -0.04009999999999 | 0.01 |
| -0.04004999999999 | 0.01 |
| -0.03999999999999 | 0.009 |
| -0.0399499999999899 | 0.009 |
| -0.0398999999999899 | 0.008 |
| -0.0398499999999899 | 0.008 |
| -0.0397999999999899 | 0.008 |
| -0.0397499999999899 | 0.007 |
| -0.0396999999999899 | 0.007 |
| -0.0396499999999899 | 0.007 |
| -0.0395999999999899 | 0.006 |
| -0.0395499999999899 | 0.006 |
| -0.0394999999999899 | 0.006 |
| -0.0394499999999899 | 0.005 |
| -0.0393999999999899 | 0.005 |
| -0.0393499999999898 | 0.005 |
| -0.0392999999999898 | 0.004 |
| -0.0392499999999898 | 0.004 |
| -0.0391999999999898 | 0.004 |
| -0.0391499999999898 | 0.003 |
| -0.0390999999999898 | 0.003 |
| -0.0390499999999898 | 0.003 |
| -0.0389999999999898 | 0.003 |
| -0.0389499999999898 | 0.002 |
| -0.0388999999999898 | 0.002 |
| -0.0388499999999898 | 0.002 |
| -0.0387999999999898 | 0.002 |
| -0.0387499999999897 | 0.002 |
| -0.0386999999999897 | 0.001 |
| -0.0386499999999897 | 0.001 |
| -0.0385999999999897 | 0.001 |
| -0.0385499999999897 | 0.001 |
| -0.0384999999999897 | 0.001 |
| -0.0384499999999897 | 0.001 |
| -0.0383999999999897 | 0 |
| -0.0383499999999897 | 0 |
| -0.0382999999999897 | 0 |
| -0.0382499999999897 | 0 |
| -0.0381999999999897 | 0 |
| -0.0381499999999896 | 0 |
| -0.0380999999999896 | 0 |
| -0.0380499999999896 | 0 |
| -0.0379999999999896 | 0 |
| -0.0379499999999896 | 0 |
| -0.0378999999999896 | 0 |
| -0.0378499999999896 | 0 |
| -0.0377999999999896 | 0 |
| -0.0377499999999896 | 0 |
| -0.0376999999999896 | 0 |
| -0.0376499999999896 | 0 |
| -0.0375999999999896 | 0 |
| -0.0375499999999895 | 0.001 |
| -0.0374999999999895 | 0.001 |
| -0.0374499999999895 | 0.001 |
| -0.0373999999999895 | 0.001 |
| -0.0373499999999895 | 0.001 |
| -0.0372999999999895 | 0.001 |
| -0.0372499999999895 | 0.002 |
| -0.0371999999999895 | 0.002 |
| -0.0371499999999895 | 0.002 |
| -0.0370999999999895 | 0.002 |
| -0.0370499999999895 | 0.003 |
| -0.0369999999999895 | 0.003 |
| -0.0369499999999894 | 0.003 |
| -0.0368999999999894 | 0.003 |
| -0.0368499999999894 | 0.004 |
| -0.0367999999999894 | 0.004 |
| -0.0367499999999894 | 0.004 |
| -0.0366999999999894 | 0.005 |
| -0.0366499999999894 | 0.005 |
| -0.0365999999999894 | 0.006 |
| -0.0365499999999894 | 0.006 |
| -0.0364999999999894 | 0.006 |
| -0.0364499999999894 | 0.007 |
| -0.0363999999999894 | 0.007 |
| -0.0363499999999893 | 0.008 |
| -0.0362999999999893 | 0.008 |
| -0.0362499999999893 | 0.009 |
| -0.0361999999999893 | 0.009 |
| -0.0361499999999893 | 0.01 |
| -0.0360999999999893 | 0.01 |
| -0.0360499999999893 | 0.011 |
| -0.0359999999999893 | 0.011 |
| -0.0359499999999893 | 0.012 |
| -0.0358999999999893 | 0.012 |
| -0.0358499999999893 | 0.013 |
| -0.0357999999999893 | 0.014 |
| -0.0357499999999892 | 0.014 |
| -0.0356999999999892 | 0.015 |
| -0.0356499999999892 | 0.015 |
| -0.0355999999999892 | 0.016 |
| -0.0355499999999892 | 0.017 |
| -0.0354999999999892 | 0.017 |
| -0.0354499999999892 | 0.018 |
| -0.0353999999999892 | 0.019 |
| -0.0353499999999892 | 0.019 |
| -0.0352999999999892 | 0.02 |
| -0.0352499999999892 | 0.021 |
| -0.0351999999999892 | 0.021 |
| -0.0351499999999891 | 0.022 |
| -0.0350999999999891 | 0.023 |
| -0.0350499999999891 | 0.023 |
| -0.0349999999999891 | 0.024 |
| -0.0349499999999891 | 0.025 |
| -0.0348999999999891 | 0.026 |
| -0.0348499999999891 | 0.026 |
| -0.0347999999999891 | 0.027 |
| -0.0347499999999891 | 0.028 |
| -0.0346999999999891 | 0.029 |
| -0.0346499999999891 | 0.029 |
| -0.0345999999999891 | 0.03 |
| -0.034549999999989 | 0.031 |
| -0.034499999999989 | 0.032 |
| -0.034449999999989 | 0.032 |
| -0.034399999999989 | 0.033 |
| -0.034349999999989 | 0.034 |
| -0.034299999999989 | 0.035 |
| -0.034249999999989 | 0.035 |
| -0.034199999999989 | 0.036 |
| -0.034149999999989 | 0.037 |
| -0.034099999999989 | 0.038 |
| -0.034049999999989 | 0.038 |
| -0.033999999999989 | 0.039 |
| -0.0339499999999889 | 0.04 |
| -0.0338999999999889 | 0.041 |
| -0.0338499999999889 | 0.042 |
| -0.0337999999999889 | 0.042 |
| -0.0337499999999889 | 0.043 |
| -0.0336999999999889 | 0.044 |
| -0.0336499999999889 | 0.044 |
| -0.0335999999999889 | 0.045 |
| -0.0335499999999889 | 0.046 |
| -0.0334999999999889 | 0.047 |
| -0.0334499999999889 | 0.047 |
| -0.0333999999999888 | 0.048 |
| -0.0333499999999888 | 0.049 |
| -0.0332999999999888 | 0.049 |
| -0.0332499999999888 | 0.05 |
| -0.0331999999999888 | 0.051 |
| -0.0331499999999888 | 0.051 |
| -0.0330999999999888 | 0.052 |
| -0.0330499999999888 | 0.053 |
| -0.0329999999999888 | 0.053 |
| -0.0329499999999888 | 0.054 |
| -0.0328999999999888 | 0.054 |
| -0.0328499999999888 | 0.055 |
| -0.0327999999999887 | 0.056 |
| -0.0327499999999887 | 0.056 |
| -0.0326999999999887 | 0.057 |
| -0.0326499999999887 | 0.057 |
| -0.0325999999999887 | 0.058 |
| -0.0325499999999887 | 0.058 |
| -0.0324999999999887 | 0.059 |
| -0.0324499999999887 | 0.059 |
| -0.0323999999999887 | 0.06 |
| -0.0323499999999887 | 0.06 |
| -0.0322999999999887 | 0.061 |
| -0.0322499999999887 | 0.061 |
| -0.0321999999999886 | 0.062 |
| -0.0321499999999886 | 0.062 |
| -0.0320999999999886 | 0.062 |
| -0.0320499999999886 | 0.063 |
| -0.0319999999999886 | 0.063 |
| -0.0319499999999886 | 0.063 |
| -0.0318999999999886 | 0.064 |
| -0.0318499999999886 | 0.064 |
| -0.0317999999999886 | 0.064 |
| -0.0317499999999886 | 0.064 |
| -0.0316999999999886 | 0.065 |
| -0.0316499999999886 | 0.065 |
| -0.0315999999999885 | 0.065 |
| -0.0315499999999885 | 0.065 |
| -0.0314999999999885 | 0.065 |
| -0.0314499999999885 | 0.066 |
| -0.0313999999999885 | 0.066 |
| -0.0313499999999885 | 0.066 |
| -0.0312999999999885 | 0.066 |
| -0.0312499999999885 | 0.066 |
| -0.0311999999999885 | 0.066 |
| -0.0311499999999885 | 0.066 |
| -0.0310999999999885 | 0.066 |
| -0.0310499999999885 | 0.066 |
| -0.0309999999999884 | 0.066 |
| -0.0309499999999884 | 0.066 |
| -0.0308999999999884 | 0.066 |
| -0.0308499999999884 | 0.066 |
| -0.0307999999999884 | 0.065 |
| -0.0307499999999884 | 0.065 |
| -0.0306999999999884 | 0.065 |
| -0.0306499999999884 | 0.065 |
| -0.0305999999999884 | 0.065 |
| -0.0305499999999884 | 0.065 |
| -0.0304999999999884 | 0.064 |
| -0.0304499999999884 | 0.064 |
| -0.0303999999999883 | 0.064 |
| -0.0303499999999883 | 0.063 |
| -0.0302999999999883 | 0.063 |
| -0.0302499999999883 | 0.063 |
| -0.0301999999999883 | 0.062 |
| -0.0301499999999883 | 0.062 |
| -0.0300999999999883 | 0.062 |
| -0.0300499999999883 | 0.061 |
| -0.0299999999999883 | 0.061 |
| -0.0299499999999883 | 0.06 |
| -0.0298999999999883 | 0.06 |
| -0.0298499999999883 | 0.059 |
| -0.0297999999999882 | 0.059 |
| -0.0297499999999882 | 0.058 |
| -0.0296999999999882 | 0.058 |
| -0.0296499999999882 | 0.057 |
| -0.0295999999999882 | 0.057 |
| -0.0295499999999882 | 0.056 |
| -0.0294999999999882 | 0.055 |
| -0.0294499999999882 | 0.055 |
| -0.0293999999999882 | 0.054 |
| -0.0293499999999882 | 0.053 |
| -0.0292999999999882 | 0.053 |
| -0.0292499999999882 | 0.052 |
| -0.0291999999999881 | 0.051 |
| -0.0291499999999881 | 0.051 |
| -0.0290999999999881 | 0.05 |
| -0.0290499999999881 | 0.049 |
| -0.0289999999999881 | 0.048 |
| -0.0289499999999881 | 0.048 |
| -0.0288999999999881 | 0.047 |
| -0.0288499999999881 | 0.046 |
| -0.0287999999999881 | 0.045 |
| -0.0287499999999881 | 0.044 |
| -0.0286999999999881 | 0.044 |
| -0.0286499999999881 | 0.043 |
| -0.028599999999988 | 0.042 |
| -0.028549999999988 | 0.041 |
| -0.028499999999988 | 0.04 |
| -0.028449999999988 | 0.039 |
| -0.028399999999988 | 0.039 |
| -0.028349999999988 | 0.038 |
| -0.028299999999988 | 0.037 |
| -0.028249999999988 | 0.036 |
| -0.028199999999988 | 0.035 |
| -0.028149999999988 | 0.034 |
| -0.028099999999988 | 0.033 |
| -0.028049999999988 | 0.032 |
| -0.0279999999999879 | 0.031 |
| -0.0279499999999879 | 0.031 |
| -0.0278999999999879 | 0.03 |
| -0.0278499999999879 | 0.029 |
| -0.0277999999999879 | 0.028 |
| -0.0277499999999879 | 0.027 |
| -0.0276999999999879 | 0.026 |
| -0.0276499999999879 | 0.025 |
| -0.0275999999999879 | 0.024 |
| -0.0275499999999879 | 0.024 |
| -0.0274999999999879 | 0.023 |
| -0.0274499999999879 | 0.022 |
| -0.0273999999999878 | 0.021 |
| -0.0273499999999878 | 0.02 |
| -0.0272999999999878 | 0.019 |
| -0.0272499999999878 | 0.019 |
| -0.0271999999999878 | 0.018 |
| -0.0271499999999878 | 0.017 |
| -0.0270999999999878 | 0.016 |
| -0.0270499999999878 | 0.015 |
| -0.0269999999999878 | 0.015 |
| -0.0269499999999878 | 0.014 |
| -0.0268999999999878 | 0.013 |
| -0.0268499999999878 | 0.012 |
| -0.0267999999999877 | 0.012 |
| -0.0267499999999877 | 0.011 |
| -0.0266999999999877 | 0.01 |
| -0.0266499999999877 | 0.01 |
| -0.0265999999999877 | 0.009 |
| -0.0265499999999877 | 0.008 |
| -0.0264999999999877 | 0.008 |
| -0.0264499999999877 | 0.007 |
| -0.0263999999999877 | 0.007 |
| -0.0263499999999877 | 0.006 |
| -0.0262999999999877 | 0.005 |
| -0.0262499999999877 | 0.005 |
| -0.0261999999999876 | 0.004 |
| -0.0261499999999876 | 0.004 |
| -0.0260999999999876 | 0.004 |
| -0.0260499999999876 | 0.003 |
| -0.0259999999999876 | 0.003 |
| -0.0259499999999876 | 0.002 |
| -0.0258999999999876 | 0.002 |
| -0.0258499999999876 | 0.002 |
| -0.0257999999999876 | 0.001 |
| -0.0257499999999876 | 0.001 |
| -0.0256999999999876 | 0.001 |
| -0.0256499999999876 | 0.001 |
| -0.0255999999999875 | 0 |
| -0.0255499999999875 | 0 |
| -0.0254999999999875 | 0 |
| -0.0254499999999875 | 0 |
| -0.0253999999999875 | 0 |
| -0.0253499999999875 | 0 |
| -0.0252999999999875 | 0 |
| -0.0252499999999875 | 0 |
| -0.0251999999999875 | 0 |
| -0.0251499999999875 | 0 |
| -0.0250999999999875 | 0 |
| -0.0250499999999875 | 0 |
| -0.0249999999999874 | 0.001 |
| -0.0249499999999874 | 0.001 |
| -0.0248999999999874 | 0.001 |
| -0.0248499999999874 | 0.001 |
| -0.0247999999999874 | 0.002 |
| -0.0247499999999874 | 0.002 |
| -0.0246999999999874 | 0.003 |
| -0.0246499999999874 | 0.003 |
| -0.0245999999999874 | 0.003 |
| -0.0245499999999874 | 0.004 |
| -0.0244999999999874 | 0.004 |
| -0.0244499999999874 | 0.005 |
| -0.0243999999999873 | 0.006 |
| -0.0243499999999873 | 0.006 |
| -0.0242999999999873 | 0.007 |
| -0.0242499999999873 | 0.008 |
| -0.0241999999999873 | 0.008 |
| -0.0241499999999873 | 0.009 |
| -0.0240999999999873 | 0.01 |
| -0.0240499999999873 | 0.011 |
| -0.0239999999999873 | 0.012 |
| -0.0239499999999873 | 0.013 |
| -0.0238999999999873 | 0.014 |
| -0.0238499999999873 | 0.015 |
| -0.0237999999999872 | 0.016 |
| -0.0237499999999872 | 0.017 |
| -0.0236999999999872 | 0.018 |
| -0.0236499999999872 | 0.019 |
| -0.0235999999999872 | 0.02 |
| -0.0235499999999872 | 0.021 |
| -0.0234999999999872 | 0.022 |
| -0.0234499999999872 | 0.024 |
| -0.0233999999999872 | 0.025 |
| -0.0233499999999872 | 0.026 |
| -0.0232999999999872 | 0.028 |
| -0.0232499999999872 | 0.029 |
| -0.0231999999999871 | 0.03 |
| -0.0231499999999871 | 0.032 |
| -0.0230999999999871 | 0.033 |
| -0.0230499999999871 | 0.035 |
| -0.0229999999999871 | 0.036 |
| -0.0229499999999871 | 0.038 |
| -0.0228999999999871 | 0.04 |
| -0.0228499999999871 | 0.041 |
| -0.0227999999999871 | 0.043 |
| -0.0227499999999871 | 0.045 |
| -0.0226999999999871 | 0.046 |
| -0.022649999999987 | 0.048 |
| -0.022599999999987 | 0.05 |
| -0.022549999999987 | 0.051 |
| -0.022499999999987 | 0.053 |
| -0.022449999999987 | 0.055 |
| -0.022399999999987 | 0.057 |
| -0.022349999999987 | 0.059 |
| -0.022299999999987 | 0.061 |
| -0.022249999999987 | 0.063 |
| -0.022199999999987 | 0.064 |
| -0.022149999999987 | 0.066 |
| -0.022099999999987 | 0.068 |
| -0.0220499999999869 | 0.07 |
| -0.0219999999999869 | 0.072 |
| -0.0219499999999869 | 0.074 |
| -0.0218999999999869 | 0.076 |
| -0.0218499999999869 | 0.078 |
| -0.0217999999999869 | 0.08 |
| -0.0217499999999869 | 0.082 |
| -0.0216999999999869 | 0.084 |
| -0.0216499999999869 | 0.087 |
| -0.0215999999999869 | 0.089 |
| -0.0215499999999869 | 0.091 |
| -0.0214999999999869 | 0.093 |
| -0.0214499999999868 | 0.095 |
| -0.0213999999999868 | 0.097 |
| -0.0213499999999868 | 0.099 |
| -0.0212999999999868 | 0.101 |
| -0.0212499999999868 | 0.103 |
| -0.0211999999999868 | 0.105 |
| -0.0211499999999868 | 0.107 |
| -0.0210999999999868 | 0.109 |
| -0.0210499999999868 | 0.112 |
| -0.0209999999999868 | 0.114 |
| -0.0209499999999868 | 0.116 |
| -0.0208999999999868 | 0.118 |
| -0.0208499999999867 | 0.12 |
| -0.0207999999999867 | 0.122 |
| -0.0207499999999867 | 0.124 |
| -0.0206999999999867 | 0.126 |
| -0.0206499999999867 | 0.128 |
| -0.0205999999999867 | 0.13 |
| -0.0205499999999867 | 0.132 |
| -0.0204999999999867 | 0.134 |
| -0.0204499999999867 | 0.136 |
| -0.0203999999999867 | 0.138 |
| -0.0203499999999867 | 0.14 |
| -0.0202999999999867 | 0.142 |
| -0.0202499999999866 | 0.143 |
| -0.0201999999999866 | 0.145 |
| -0.0201499999999866 | 0.147 |
| -0.0200999999999866 | 0.149 |
| -0.0200499999999866 | 0.151 |
| -0.0199999999999866 | 0.152 |
| -0.0199499999999866 | 0.154 |
| -0.0198999999999866 | 0.156 |
| -0.0198499999999866 | 0.158 |
| -0.0197999999999866 | 0.159 |
| -0.0197499999999866 | 0.161 |
| -0.0196999999999866 | 0.162 |
| -0.0196499999999865 | 0.164 |
| -0.0195999999999865 | 0.165 |
| -0.0195499999999865 | 0.167 |
| -0.0194999999999865 | 0.168 |
| -0.0194499999999865 | 0.17 |
| -0.0193999999999865 | 0.171 |
| -0.0193499999999865 | 0.172 |
| -0.0192999999999865 | 0.173 |
| -0.0192499999999865 | 0.175 |
| -0.0191999999999865 | 0.176 |
| -0.0191499999999865 | 0.177 |
| -0.0190999999999865 | 0.178 |
| -0.0190499999999864 | 0.179 |
| -0.0189999999999864 | 0.18 |
| -0.0189499999999864 | 0.181 |
| -0.0188999999999864 | 0.182 |
| -0.0188499999999864 | 0.183 |
| -0.0187999999999864 | 0.183 |
| -0.0187499999999864 | 0.184 |
| -0.0186999999999864 | 0.185 |
| -0.0186499999999864 | 0.185 |
| -0.0185999999999864 | 0.186 |
| -0.0185499999999864 | 0.187 |
| -0.0184999999999864 | 0.187 |
| -0.0184499999999863 | 0.187 |
| -0.0183999999999863 | 0.188 |
| -0.0183499999999863 | 0.188 |
| -0.0182999999999863 | 0.188 |
| -0.0182499999999863 | 0.189 |
| -0.0181999999999863 | 0.189 |
| -0.0181499999999863 | 0.189 |
| -0.0180999999999863 | 0.189 |
| -0.0180499999999863 | 0.189 |
| -0.0179999999999863 | 0.189 |
| -0.0179499999999863 | 0.188 |
| -0.0178999999999863 | 0.188 |
| -0.0178499999999862 | 0.188 |
| -0.0177999999999862 | 0.188 |
| -0.0177499999999862 | 0.187 |
| -0.0176999999999862 | 0.187 |
| -0.0176499999999862 | 0.186 |
| -0.0175999999999862 | 0.186 |
| -0.0175499999999862 | 0.185 |
| -0.0174999999999862 | 0.184 |
| -0.0174499999999862 | 0.184 |
| -0.0173999999999862 | 0.183 |
| -0.0173499999999862 | 0.182 |
| -0.0172999999999862 | 0.181 |
| -0.0172499999999861 | 0.18 |
| -0.0171999999999861 | 0.179 |
| -0.0171499999999861 | 0.178 |
| -0.0170999999999861 | 0.177 |
| -0.0170499999999861 | 0.176 |
| -0.0169999999999861 | 0.174 |
| -0.0169499999999861 | 0.173 |
| -0.0168999999999861 | 0.172 |
| -0.0168499999999861 | 0.17 |
| -0.0167999999999861 | 0.169 |
| -0.0167499999999861 | 0.167 |
| -0.0166999999999861 | 0.165 |
| -0.016649999999986 | 0.164 |
| -0.016599999999986 | 0.162 |
| -0.016549999999986 | 0.16 |
| -0.016499999999986 | 0.158 |
| -0.016449999999986 | 0.157 |
| -0.016399999999986 | 0.155 |
| -0.016349999999986 | 0.153 |
| -0.016299999999986 | 0.151 |
| -0.016249999999986 | 0.149 |
| -0.016199999999986 | 0.147 |
| -0.016149999999986 | 0.144 |
| -0.016099999999986 | 0.142 |
| -0.0160499999999859 | 0.14 |
| -0.0159999999999859 | 0.138 |
| -0.0159499999999859 | 0.136 |
| -0.0158999999999859 | 0.133 |
| -0.0158499999999859 | 0.131 |
| -0.0157999999999859 | 0.128 |
| -0.0157499999999859 | 0.126 |
| -0.0156999999999859 | 0.124 |
| -0.0156499999999859 | 0.121 |
| -0.0155999999999859 | 0.119 |
| -0.0155499999999859 | 0.116 |
| -0.0154999999999859 | 0.113 |
| -0.0154499999999858 | 0.111 |
| -0.0153999999999858 | 0.108 |
| -0.0153499999999858 | 0.106 |
| -0.0152999999999858 | 0.103 |
| -0.0152499999999858 | 0.1 |
| -0.0151999999999858 | 0.098 |
| -0.0151499999999858 | 0.095 |
| -0.0150999999999858 | 0.092 |
| -0.0150499999999858 | 0.09 |
| -0.0149999999999858 | 0.087 |
| -0.0149499999999858 | 0.084 |
| -0.0148999999999858 | 0.081 |
| -0.0148499999999857 | 0.079 |
| -0.0147999999999857 | 0.076 |
| -0.0147499999999857 | 0.073 |
| -0.0146999999999857 | 0.071 |
| -0.0146499999999857 | 0.068 |
| -0.0145999999999857 | 0.065 |
| -0.0145499999999857 | 0.063 |
| -0.0144999999999857 | 0.06 |
| -0.0144499999999857 | 0.057 |
| -0.0143999999999857 | 0.055 |
| -0.0143499999999857 | 0.052 |
| -0.0142999999999857 | 0.05 |
| -0.0142499999999856 | 0.047 |
| -0.0141999999999856 | 0.045 |
| -0.0141499999999856 | 0.042 |
| -0.0140999999999856 | 0.04 |
| -0.0140499999999856 | 0.038 |
| -0.0139999999999856 | 0.035 |
| -0.0139499999999856 | 0.033 |
| -0.0138999999999856 | 0.031 |
| -0.0138499999999856 | 0.029 |
| -0.0137999999999856 | 0.027 |
| -0.0137499999999856 | 0.025 |
| -0.0136999999999856 | 0.023 |
| -0.0136499999999855 | 0.021 |
| -0.0135999999999855 | 0.019 |
| -0.0135499999999855 | 0.017 |
| -0.0134999999999855 | 0.015 |
| -0.0134499999999855 | 0.014 |
| -0.0133999999999855 | 0.012 |
| -0.0133499999999855 | 0.011 |
| -0.0132999999999855 | 0.009 |
| -0.0132499999999855 | 0.008 |
| -0.0131999999999855 | 0.007 |
| -0.0131499999999855 | 0.006 |
| -0.0130999999999855 | 0.004 |
| -0.0130499999999854 | 0.004 |
| -0.0129999999999854 | 0.003 |
| -0.0129499999999854 | 0.002 |
| -0.0128999999999854 | 0.001 |
| -0.0128499999999854 | 0.001 |
| -0.0127999999999854 | 0 |
| -0.0127499999999854 | 0 |
| -0.0126999999999854 | 0 |
| -0.0126499999999854 | 0 |
| -0.0125999999999854 | 0 |
| -0.0125499999999854 | 0 |
| -0.0124999999999854 | 0.001 |
| -0.0124499999999853 | 0.001 |
| -0.0123999999999853 | 0.002 |
| -0.0123499999999853 | 0.003 |
| -0.0122999999999853 | 0.003 |
| -0.0122499999999853 | 0.004 |
| -0.0121999999999853 | 0.006 |
| -0.0121499999999853 | 0.007 |
| -0.0120999999999853 | 0.009 |
| -0.0120499999999853 | 0.01 |
| -0.0119999999999853 | 0.012 |
| -0.0119499999999853 | 0.014 |
| -0.0118999999999853 | 0.016 |
| -0.0118499999999852 | 0.018 |
| -0.0117999999999852 | 0.021 |
| -0.0117499999999852 | 0.024 |
| -0.0116999999999852 | 0.026 |
| -0.0116499999999852 | 0.029 |
| -0.0115999999999852 | 0.033 |
| -0.0115499999999852 | 0.036 |
| -0.0114999999999852 | 0.04 |
| -0.0114499999999852 | 0.043 |
| -0.0113999999999852 | 0.047 |
| -0.0113499999999852 | 0.051 |
| -0.0112999999999851 | 0.056 |
| -0.0112499999999851 | 0.06 |
| -0.0111999999999851 | 0.065 |
| -0.0111499999999851 | 0.07 |
| -0.0110999999999851 | 0.075 |
| -0.0110499999999851 | 0.081 |
| -0.0109999999999851 | 0.086 |
| -0.0109499999999851 | 0.092 |
| -0.0108999999999851 | 0.098 |
| -0.0108499999999851 | 0.104 |
| -0.0107999999999851 | 0.11 |
| -0.0107499999999851 | 0.117 |
| -0.010699999999985 | 0.124 |
| -0.010649999999985 | 0.131 |
| -0.010599999999985 | 0.138 |
| -0.010549999999985 | 0.146 |
| -0.010499999999985 | 0.154 |
| -0.010449999999985 | 0.162 |
| -0.010399999999985 | 0.17 |
| -0.010349999999985 | 0.178 |
| -0.010299999999985 | 0.187 |
| -0.010249999999985 | 0.196 |
| -0.010199999999985 | 0.205 |
| -0.010149999999985 | 0.215 |
| -0.0100999999999849 | 0.224 |
| -0.0100499999999849 | 0.234 |
| -0.00999999999998491 | 0.244 |
| -0.0099499999999849 | 0.255 |
| -0.00989999999998491 | 0.265 |
| -0.0098499999999849 | 0.276 |
| -0.0097999999999849 | 0.287 |
| -0.00974999999998491 | 0.299 |
| -0.0096999999999849 | 0.31 |
| -0.00964999999998491 | 0.322 |
| -0.00959999999998491 | 0.334 |
| -0.0095499999999849 | 0.346 |
| -0.00949999999998481 | 0.359 |
| -0.0094499999999848 | 0.372 |
| -0.00939999999998481 | 0.385 |
| -0.0093499999999848 | 0.398 |
| -0.00929999999998481 | 0.412 |
| -0.00924999999998481 | 0.426 |
| -0.0091999999999848 | 0.44 |
| -0.00914999999998481 | 0.454 |
| -0.0090999999999848 | 0.469 |
| -0.00904999999998481 | 0.483 |
| -0.00899999999998481 | 0.499 |
| -0.0089499999999848 | 0.514 |
| -0.00889999999998471 | 0.529 |
| -0.0088499999999847 | 0.545 |
| -0.00879999999998471 | 0.561 |
| -0.0087499999999847 | 0.578 |
| -0.00869999999998471 | 0.594 |
| -0.00864999999998471 | 0.611 |
| -0.0085999999999847 | 0.628 |
| -0.00854999999998471 | 0.645 |
| -0.0084999999999847 | 0.663 |
| -0.00844999999998471 | 0.68 |
| -0.00839999999998471 | 0.698 |
| -0.0083499999999847 | 0.717 |
| -0.00829999999998461 | 0.735 |
| -0.0082499999999846 | 0.754 |
| -0.00819999999998461 | 0.773 |
| -0.0081499999999846 | 0.792 |
| -0.00809999999998461 | 0.811 |
| -0.00804999999998461 | 0.831 |
| -0.0079999999999846 | 0.85 |
| -0.00794999999998461 | 0.87 |
| -0.0078999999999846 | 0.891 |
| -0.00784999999998461 | 0.911 |
| -0.00779999999998461 | 0.932 |
| -0.0077499999999846 | 0.953 |
| -0.00769999999998451 | 0.974 |
| -0.0076499999999845 | 0.995 |
| -0.00759999999998451 | 1.017 |
| -0.0075499999999845 | 1.038 |
| -0.00749999999998451 | 1.06 |
| -0.00744999999998451 | 1.082 |
| -0.0073999999999845 | 1.105 |
| -0.00734999999998451 | 1.127 |
| -0.0072999999999845 | 1.15 |
| -0.0072499999999845 | 1.173 |
| -0.00719999999998451 | 1.196 |
| -0.0071499999999845 | 1.219 |
| -0.00709999999998441 | 1.242 |
| -0.0070499999999844 | 1.266 |
| -0.00699999999998441 | 1.289 |
| -0.0069499999999844 | 1.313 |
| -0.0068999999999844 | 1.337 |
| -0.00684999999998441 | 1.361 |
| -0.0067999999999844 | 1.386 |
| -0.00674999999998441 | 1.41 |
| -0.0066999999999844 | 1.435 |
| -0.0066499999999844 | 1.46 |
| -0.00659999999998441 | 1.485 |
| -0.0065499999999844 | 1.51 |
| -0.00649999999998431 | 1.535 |
| -0.0064499999999843 | 1.56 |
| -0.00639999999998431 | 1.585 |
| -0.0063499999999843 | 1.611 |
| -0.0062999999999843 | 1.637 |
| -0.00624999999998431 | 1.662 |
| -0.0061999999999843 | 1.688 |
| -0.00614999999998431 | 1.714 |
| -0.00609999999998431 | 1.74 |
| -0.0060499999999843 | 1.766 |
| -0.00599999999998431 | 1.792 |
| -0.0059499999999843 | 1.819 |
| -0.00589999999998421 | 1.845 |
| -0.0058499999999842 | 1.871 |
| -0.00579999999998421 | 1.898 |
| -0.00574999999998421 | 1.924 |
| -0.0056999999999842 | 1.951 |
| -0.00564999999998421 | 1.977 |
| -0.0055999999999842 | 2.004 |
| -0.00554999999998421 | 2.031 |
| -0.00549999999998421 | 2.058 |
| -0.0054499999999842 | 2.084 |
| -0.00539999999998421 | 2.111 |
| -0.0053499999999842 | 2.138 |
| -0.00529999999998411 | 2.165 |
| -0.0052499999999841 | 2.191 |
| -0.00519999999998411 | 2.218 |
| -0.00514999999998411 | 2.245 |
| -0.0050999999999841 | 2.272 |
| -0.00504999999998411 | 2.299 |
| -0.0049999999999841 | 2.325 |
| -0.00494999999998411 | 2.352 |
| -0.00489999999998411 | 2.379 |
| -0.0048499999999841 | 2.405 |
| -0.00479999999998411 | 2.432 |
| -0.0047499999999841 | 2.459 |
| -0.00469999999998401 | 2.485 |
| -0.004649999999984 | 2.512 |
| -0.00459999999998401 | 2.538 |
| -0.00454999999998401 | 2.564 |
| -0.004499999999984 | 2.591 |
| -0.00444999999998401 | 2.617 |
| -0.004399999999984 | 2.643 |
| -0.00434999999998401 | 2.669 |
| -0.00429999999998401 | 2.695 |
| -0.004249999999984 | 2.72 |
| -0.00419999999998401 | 2.746 |
| -0.004149999999984 | 2.771 |
| -0.00409999999998391 | 2.797 |
| -0.0040499999999839 | 2.822 |
| -0.00399999999998391 | 2.847 |
| -0.00394999999998391 | 2.872 |
| -0.0038999999999839 | 2.897 |
| -0.00384999999998391 | 2.922 |
| -0.0037999999999839 | 2.946 |
| -0.00374999999998391 | 2.971 |
| -0.00369999999998391 | 2.995 |
| -0.0036499999999839 | 3.019 |
| -0.00359999999998391 | 3.043 |
| -0.0035499999999839 | 3.067 |
| -0.00349999999998381 | 3.09 |
| -0.0034499999999838 | 3.113 |
| -0.0033999999999838 | 3.137 |
| -0.00334999999998381 | 3.159 |
| -0.0032999999999838 | 3.182 |
| -0.00324999999998381 | 3.205 |
| -0.0031999999999838 | 3.227 |
| -0.0031499999999838 | 3.249 |
| -0.00309999999998381 | 3.271 |
| -0.0030499999999838 | 3.292 |
| -0.00299999999998381 | 3.314 |
| -0.0029499999999838 | 3.335 |
| -0.00289999999998371 | 3.355 |
| -0.0028499999999837 | 3.376 |
| -0.0027999999999837 | 3.396 |
| -0.00274999999998371 | 3.416 |
| -0.0026999999999837 | 3.436 |
| -0.00264999999998371 | 3.456 |
| -0.0025999999999837 | 3.475 |
| -0.0025499999999837 | 3.494 |
| -0.00249999999998371 | 3.512 |
| -0.0024499999999837 | 3.531 |
| -0.00239999999998371 | 3.549 |
| -0.00234999999998371 | 3.567 |
| -0.00229999999998361 | 3.584 |
| -0.00224999999998361 | 3.601 |
| -0.0021999999999836 | 3.618 |
| -0.00214999999998361 | 3.635 |
| -0.0020999999999836 | 3.651 |
| -0.00204999999998361 | 3.667 |
| -0.00199999999998361 | 3.682 |
| -0.0019499999999836 | 3.697 |
| -0.00189999999998361 | 3.712 |
| -0.0018499999999836 | 3.727 |
| -0.00179999999998361 | 3.741 |
| -0.00174999999998361 | 3.755 |
| -0.00169999999998351 | 3.768 |
| -0.00164999999998351 | 3.781 |
| -0.0015999999999835 | 3.794 |
| -0.00154999999998351 | 3.807 |
| -0.0014999999999835 | 3.819 |
| -0.00144999999998351 | 3.83 |
| -0.00139999999998351 | 3.842 |
| -0.0013499999999835 | 3.853 |
| -0.00129999999998351 | 3.863 |
| -0.0012499999999835 | 3.873 |
| -0.00119999999998351 | 3.883 |
| -0.00114999999998351 | 3.893 |
| -0.00109999999998341 | 3.902 |
| -0.00104999999998341 | 3.91 |
| -0.000999999999983403 | 3.919 |
| -0.000949999999983409 | 3.926 |
| -0.0008999999999834 | 3.934 |
| -0.000849999999983406 | 3.941 |
| -0.000799999999983411 | 3.948 |
| -0.000749999999983403 | 3.954 |
| -0.000699999999983408 | 3.96 |
| -0.0006499999999834 | 3.965 |
| -0.000599999999983405 | 3.971 |
| -0.0005499999999833 | 3.975 |
| -0.000499999999983305 | 3.98 |
| -0.000449999999983311 | 3.983 |
| -0.000399999999983303 | 3.987 |
| -0.000349999999983308 | 3.99 |
| -0.0002999999999833 | 3.993 |
| -0.000249999999983305 | 3.995 |
| -0.000199999999983311 | 3.997 |
| -0.000149999999983302 | 3.998 |
| -9.99999999833079e-05 | 3.999 |
| -4.99999999832995e-05 | 4 |
| 1.70002900645727e-14 | 4 |
| 5.00000000169948e-05 | 4 |
| 0.000100000000016989 | 3.999 |
| 0.000150000000016998 | 3.998 |
| 0.000200000000016992 | 3.997 |
| 0.000250000000017001 | 3.995 |
| 0.000300000000016995 | 3.993 |
| 0.000350000000016989 | 3.99 |
| 0.000400000000016998 | 3.987 |
| 0.000450000000016992 | 3.983 |
| 0.000500000000017001 | 3.98 |
| 0.000550000000016995 | 3.975 |
| 0.00060000000001699 | 3.971 |
| 0.000650000000016998 | 3.965 |
| 0.000700000000016993 | 3.96 |
| 0.000750000000017001 | 3.954 |
| 0.000800000000016995 | 3.948 |
| 0.00085000000001699 | 3.941 |
| 0.000900000000016998 | 3.934 |
| 0.000950000000016993 | 3.926 |
| 0.001000000000017 | 3.919 |
| 0.001050000000017 | 3.91 |
| 0.00110000000001699 | 3.902 |
| 0.001150000000017 | 3.893 |
| 0.00120000000001699 | 3.883 |
| 0.00125000000001699 | 3.873 |
| 0.001300000000017 | 3.863 |
| 0.00135000000001699 | 3.853 |
| 0.001400000000017 | 3.842 |
| 0.00145000000001699 | 3.83 |
| 0.00150000000001699 | 3.819 |
| 0.001550000000017 | 3.807 |
| 0.00160000000001699 | 3.794 |
| 0.001650000000017 | 3.781 |
| 0.00170000000001699 | 3.768 |
| 0.00175000000001699 | 3.755 |
| 0.001800000000017 | 3.741 |
| 0.00185000000001699 | 3.727 |
| 0.001900000000017 | 3.712 |
| 0.00195000000001699 | 3.697 |
| 0.00200000000001699 | 3.682 |
| 0.002050000000017 | 3.667 |
| 0.00210000000001699 | 3.651 |
| 0.002150000000017 | 3.635 |
| 0.00220000000001699 | 3.618 |
| 0.00225000000001699 | 3.601 |
| 0.002300000000017 | 3.584 |
| 0.00235000000001699 | 3.567 |
| 0.002400000000017 | 3.549 |
| 0.00245000000001699 | 3.531 |
| 0.00250000000001699 | 3.512 |
| 0.002550000000017 | 3.494 |
| 0.00260000000001699 | 3.475 |
| 0.002650000000017 | 3.456 |
| 0.00270000000001699 | 3.436 |
| 0.00275000000001699 | 3.416 |
| 0.002800000000017 | 3.396 |
| 0.00285000000001699 | 3.376 |
| 0.002900000000017 | 3.355 |
| 0.00295000000001699 | 3.335 |
| 0.00300000000001699 | 3.314 |
| 0.003050000000017 | 3.292 |
| 0.00310000000001699 | 3.271 |
| 0.003150000000017 | 3.249 |
| 0.00320000000001699 | 3.227 |
| 0.00325000000001699 | 3.205 |
| 0.003300000000017 | 3.182 |
| 0.00335000000001699 | 3.159 |
| 0.003400000000017 | 3.137 |
| 0.003450000000017 | 3.113 |
| 0.00350000000001699 | 3.09 |
| 0.003550000000017 | 3.067 |
| 0.00360000000001699 | 3.043 |
| 0.003650000000017 | 3.019 |
| 0.003700000000017 | 2.995 |
| 0.00375000000001699 | 2.971 |
| 0.003800000000017 | 2.946 |
| 0.00385000000001699 | 2.922 |
| 0.003900000000017 | 2.897 |
| 0.003950000000017 | 2.872 |
| 0.00400000000001699 | 2.847 |
| 0.004050000000017 | 2.822 |
| 0.00410000000001699 | 2.797 |
| 0.004150000000017 | 2.771 |
| 0.004200000000017 | 2.746 |
| 0.00425000000001699 | 2.72 |
| 0.004300000000017 | 2.695 |
| 0.00435000000001699 | 2.669 |
| 0.00440000000001699 | 2.643 |
| 0.004450000000017 | 2.617 |
| 0.00450000000001699 | 2.591 |
| 0.004550000000018 | 2.564 |
| 0.00460000000001799 | 2.538 |
| 0.004650000000018 | 2.512 |
| 0.004700000000018 | 2.485 |
| 0.00475000000001799 | 2.459 |
| 0.004800000000018 | 2.432 |
| 0.00485000000001799 | 2.405 |
| 0.004900000000018 | 2.379 |
| 0.004950000000018 | 2.352 |
| 0.00500000000001799 | 2.325 |
| 0.005050000000018 | 2.299 |
| 0.00510000000001799 | 2.272 |
| 0.005150000000018 | 2.245 |
| 0.005200000000018 | 2.218 |
| 0.00525000000001799 | 2.191 |
| 0.005300000000018 | 2.165 |
| 0.00535000000001799 | 2.138 |
| 0.00540000000001799 | 2.111 |
| 0.005450000000018 | 2.084 |
| 0.00550000000001799 | 2.058 |
| 0.005550000000018 | 2.031 |
| 0.00560000000001799 | 2.004 |
| 0.00565000000001799 | 1.977 |
| 0.005700000000018 | 1.951 |
| 0.00575000000001799 | 1.924 |
| 0.005800000000018 | 1.898 |
| 0.00585000000001799 | 1.871 |
| 0.00590000000001799 | 1.845 |
| 0.005950000000018 | 1.819 |
| 0.00600000000001799 | 1.792 |
| 0.006050000000018 | 1.766 |
| 0.00610000000001799 | 1.74 |
| 0.00615000000001799 | 1.714 |
| 0.006200000000018 | 1.688 |
| 0.00625000000001799 | 1.662 |
| 0.006300000000018 | 1.637 |
| 0.00635000000001799 | 1.611 |
| 0.00640000000001799 | 1.585 |
| 0.006450000000018 | 1.56 |
| 0.00650000000001799 | 1.535 |
| 0.006550000000018 | 1.51 |
| 0.00660000000001799 | 1.485 |
| 0.00665000000001799 | 1.46 |
| 0.006700000000018 | 1.435 |
| 0.00675000000001799 | 1.41 |
| 0.006800000000018 | 1.386 |
| 0.00685000000001799 | 1.361 |
| 0.00690000000001799 | 1.337 |
| 0.006950000000018 | 1.313 |
| 0.00700000000001799 | 1.289 |
| 0.007050000000018 | 1.266 |
| 0.00710000000001799 | 1.242 |
| 0.00715000000001799 | 1.219 |
| 0.007200000000018 | 1.196 |
| 0.00725000000001799 | 1.173 |
| 0.007300000000018 | 1.15 |
| 0.00735000000001799 | 1.127 |
| 0.00740000000001799 | 1.105 |
| 0.007450000000018 | 1.082 |
| 0.00750000000001799 | 1.06 |
| 0.007550000000018 | 1.038 |
| 0.007600000000018 | 1.017 |
| 0.00765000000001799 | 0.995 |
| 0.007700000000018 | 0.974 |
| 0.00775000000001799 | 0.953 |
| 0.007800000000018 | 0.932 |
| 0.007850000000018 | 0.911 |
| 0.00790000000001799 | 0.891 |
| 0.007950000000018 | 0.87 |
| 0.00800000000001799 | 0.85 |
| 0.008050000000018 | 0.831 |
| 0.008100000000018 | 0.811 |
| 0.00815000000001799 | 0.792 |
| 0.008200000000018 | 0.773 |
| 0.00825000000001799 | 0.754 |
| 0.008300000000018 | 0.735 |
| 0.008350000000018 | 0.717 |
| 0.00840000000001799 | 0.698 |
| 0.008450000000018 | 0.68 |
| 0.00850000000001799 | 0.663 |
| 0.00855000000001799 | 0.645 |
| 0.008600000000018 | 0.628 |
| 0.00865000000001799 | 0.611 |
| 0.008700000000018 | 0.594 |
| 0.00875000000001799 | 0.578 |
| 0.00880000000001799 | 0.561 |
| 0.008850000000018 | 0.545 |
| 0.00890000000001799 | 0.529 |
| 0.008950000000018 | 0.514 |
| 0.00900000000001799 | 0.499 |
| 0.00905000000001799 | 0.483 |
| 0.009100000000018 | 0.469 |
| 0.00915000000001799 | 0.454 |
| 0.009200000000018 | 0.44 |
| 0.00925000000001799 | 0.426 |
| 0.00930000000001799 | 0.412 |
| 0.009350000000018 | 0.398 |
| 0.00940000000001799 | 0.385 |
| 0.009450000000018 | 0.372 |
| 0.00950000000001799 | 0.359 |
| 0.00955000000001799 | 0.346 |
| 0.009600000000018 | 0.334 |
| 0.00965000000001799 | 0.322 |
| 0.009700000000018 | 0.31 |
| 0.00975000000001799 | 0.299 |
| 0.00980000000001799 | 0.287 |
| 0.009850000000018 | 0.276 |
| 0.00990000000001799 | 0.265 |
| 0.009950000000018 | 0.255 |
| 0.010000000000018 | 0.244 |
| 0.010050000000018 | 0.234 |
| 0.010100000000018 | 0.224 |
| 0.010150000000018 | 0.215 |
| 0.010200000000018 | 0.205 |
| 0.010250000000018 | 0.196 |
| 0.010300000000018 | 0.187 |
| 0.010350000000018 | 0.178 |
| 0.010400000000018 | 0.17 |
| 0.010450000000018 | 0.162 |
| 0.010500000000019 | 0.154 |
| 0.010550000000019 | 0.146 |
| 0.010600000000019 | 0.138 |
| 0.010650000000019 | 0.131 |
| 0.010700000000019 | 0.124 |
| 0.010750000000019 | 0.117 |
| 0.010800000000019 | 0.11 |
| 0.010850000000019 | 0.104 |
| 0.010900000000019 | 0.098 |
| 0.010950000000019 | 0.092 |
| 0.011000000000019 | 0.086 |
| 0.011050000000019 | 0.081 |
| 0.011100000000019 | 0.075 |
| 0.011150000000019 | 0.07 |
| 0.011200000000019 | 0.065 |
| 0.011250000000019 | 0.06 |
| 0.011300000000019 | 0.056 |
| 0.011350000000019 | 0.051 |
| 0.011400000000019 | 0.047 |
| 0.011450000000019 | 0.043 |
| 0.011500000000019 | 0.04 |
| 0.011550000000019 | 0.036 |
| 0.011600000000019 | 0.033 |
| 0.011650000000019 | 0.029 |
| 0.011700000000019 | 0.026 |
| 0.011750000000019 | 0.024 |
| 0.011800000000019 | 0.021 |
| 0.011850000000019 | 0.018 |
| 0.011900000000019 | 0.016 |
| 0.011950000000019 | 0.014 |
| 0.012000000000019 | 0.012 |
| 0.012050000000019 | 0.01 |
| 0.012100000000019 | 0.009 |
| 0.012150000000019 | 0.007 |
| 0.012200000000019 | 0.006 |
| 0.012250000000019 | 0.004 |
| 0.012300000000019 | 0.003 |
| 0.012350000000019 | 0.003 |
| 0.012400000000019 | 0.002 |
| 0.012450000000019 | 0.001 |
| 0.012500000000019 | 0.001 |
| 0.012550000000019 | 0 |
| 0.012600000000019 | 0 |
| 0.012650000000019 | 0 |
| 0.012700000000019 | 0 |
| 0.012750000000019 | 0 |
| 0.012800000000019 | 0 |
| 0.012850000000019 | 0.001 |
| 0.012900000000019 | 0.001 |
| 0.012950000000019 | 0.002 |
| 0.013000000000019 | 0.003 |
| 0.013050000000019 | 0.004 |
| 0.013100000000019 | 0.004 |
| 0.013150000000019 | 0.006 |
| 0.013200000000019 | 0.007 |
| 0.013250000000019 | 0.008 |
| 0.013300000000019 | 0.009 |
| 0.013350000000019 | 0.011 |
| 0.013400000000019 | 0.012 |
| 0.013450000000019 | 0.014 |
| 0.013500000000019 | 0.015 |
| 0.013550000000019 | 0.017 |
| 0.013600000000019 | 0.019 |
| 0.013650000000019 | 0.021 |
| 0.013700000000019 | 0.023 |
| 0.013750000000019 | 0.025 |
| 0.013800000000019 | 0.027 |
| 0.013850000000019 | 0.029 |
| 0.013900000000019 | 0.031 |
| 0.013950000000019 | 0.033 |
| 0.014000000000019 | 0.035 |
| 0.014050000000019 | 0.038 |
| 0.014100000000019 | 0.04 |
| 0.014150000000019 | 0.042 |
| 0.014200000000019 | 0.045 |
| 0.014250000000019 | 0.047 |
| 0.014300000000019 | 0.05 |
| 0.014350000000019 | 0.052 |
| 0.014400000000019 | 0.055 |
| 0.014450000000019 | 0.057 |
| 0.014500000000019 | 0.06 |
| 0.014550000000019 | 0.063 |
| 0.014600000000019 | 0.065 |
| 0.014650000000019 | 0.068 |
| 0.014700000000019 | 0.071 |
| 0.014750000000019 | 0.073 |
| 0.014800000000019 | 0.076 |
| 0.014850000000019 | 0.079 |
| 0.014900000000019 | 0.081 |
| 0.014950000000019 | 0.084 |
| 0.015000000000019 | 0.087 |
| 0.015050000000019 | 0.09 |
| 0.015100000000019 | 0.092 |
| 0.015150000000019 | 0.095 |
| 0.015200000000019 | 0.098 |
| 0.015250000000019 | 0.1 |
| 0.015300000000019 | 0.103 |
| 0.015350000000019 | 0.106 |
| 0.015400000000019 | 0.108 |
| 0.015450000000019 | 0.111 |
| 0.015500000000019 | 0.113 |
| 0.015550000000019 | 0.116 |
| 0.015600000000019 | 0.119 |
| 0.015650000000019 | 0.121 |
| 0.015700000000019 | 0.124 |
| 0.015750000000019 | 0.126 |
| 0.015800000000019 | 0.128 |
| 0.015850000000019 | 0.131 |
| 0.015900000000019 | 0.133 |
| 0.015950000000019 | 0.136 |
| 0.016000000000019 | 0.138 |
| 0.016050000000019 | 0.14 |
| 0.016100000000019 | 0.142 |
| 0.016150000000019 | 0.144 |
| 0.016200000000019 | 0.147 |
| 0.016250000000019 | 0.149 |
| 0.016300000000019 | 0.151 |
| 0.016350000000019 | 0.153 |
| 0.016400000000019 | 0.155 |
| 0.016450000000019 | 0.157 |
| 0.01650000000002 | 0.158 |
| 0.01655000000002 | 0.16 |
| 0.01660000000002 | 0.162 |
| 0.01665000000002 | 0.164 |
| 0.01670000000002 | 0.165 |
| 0.01675000000002 | 0.167 |
| 0.01680000000002 | 0.169 |
| 0.01685000000002 | 0.17 |
| 0.01690000000002 | 0.172 |
| 0.01695000000002 | 0.173 |
| 0.01700000000002 | 0.174 |
| 0.01705000000002 | 0.176 |
| 0.01710000000002 | 0.177 |
| 0.01715000000002 | 0.178 |
| 0.01720000000002 | 0.179 |
| 0.01725000000002 | 0.18 |
| 0.01730000000002 | 0.181 |
| 0.01735000000002 | 0.182 |
| 0.01740000000002 | 0.183 |
| 0.01745000000002 | 0.184 |
| 0.01750000000002 | 0.184 |
| 0.01755000000002 | 0.185 |
| 0.01760000000002 | 0.186 |
| 0.01765000000002 | 0.186 |
| 0.01770000000002 | 0.187 |
| 0.01775000000002 | 0.187 |
| 0.01780000000002 | 0.188 |
| 0.01785000000002 | 0.188 |
| 0.01790000000002 | 0.188 |
| 0.01795000000002 | 0.188 |
| 0.01800000000002 | 0.189 |
| 0.01805000000002 | 0.189 |
| 0.01810000000002 | 0.189 |
| 0.01815000000002 | 0.189 |
| 0.01820000000002 | 0.189 |
| 0.01825000000002 | 0.189 |
| 0.01830000000002 | 0.188 |
| 0.01835000000002 | 0.188 |
| 0.01840000000002 | 0.188 |
| 0.01845000000002 | 0.187 |
| 0.01850000000002 | 0.187 |
| 0.01855000000002 | 0.187 |
| 0.01860000000002 | 0.186 |
| 0.01865000000002 | 0.185 |
| 0.01870000000002 | 0.185 |
| 0.01875000000002 | 0.184 |
| 0.01880000000002 | 0.183 |
| 0.01885000000002 | 0.183 |
| 0.01890000000002 | 0.182 |
| 0.01895000000002 | 0.181 |
| 0.01900000000002 | 0.18 |
| 0.01905000000002 | 0.179 |
| 0.01910000000002 | 0.178 |
| 0.01915000000002 | 0.177 |
| 0.01920000000002 | 0.176 |
| 0.01925000000002 | 0.175 |
| 0.01930000000002 | 0.173 |
| 0.01935000000002 | 0.172 |
| 0.01940000000002 | 0.171 |
| 0.01945000000002 | 0.17 |
| 0.01950000000002 | 0.168 |
| 0.01955000000002 | 0.167 |
| 0.01960000000002 | 0.165 |
| 0.01965000000002 | 0.164 |
| 0.01970000000002 | 0.162 |
| 0.01975000000002 | 0.161 |
| 0.01980000000002 | 0.159 |
| 0.01985000000002 | 0.158 |
| 0.01990000000002 | 0.156 |
| 0.01995000000002 | 0.154 |
| 0.02000000000002 | 0.152 |
| 0.02005000000002 | 0.151 |
| 0.02010000000002 | 0.149 |
| 0.02015000000002 | 0.147 |
| 0.02020000000002 | 0.145 |
| 0.02025000000002 | 0.143 |
| 0.02030000000002 | 0.142 |
| 0.02035000000002 | 0.14 |
| 0.02040000000002 | 0.138 |
| 0.02045000000002 | 0.136 |
| 0.02050000000002 | 0.134 |
| 0.02055000000002 | 0.132 |
| 0.02060000000002 | 0.13 |
| 0.02065000000002 | 0.128 |
| 0.02070000000002 | 0.126 |
| 0.02075000000002 | 0.124 |
| 0.02080000000002 | 0.122 |
| 0.02085000000002 | 0.12 |
| 0.02090000000002 | 0.118 |
| 0.02095000000002 | 0.116 |
| 0.02100000000002 | 0.114 |
| 0.02105000000002 | 0.112 |
| 0.02110000000002 | 0.109 |
| 0.02115000000002 | 0.107 |
| 0.02120000000002 | 0.105 |
| 0.02125000000002 | 0.103 |
| 0.02130000000002 | 0.101 |
| 0.02135000000002 | 0.099 |
| 0.02140000000002 | 0.097 |
| 0.02145000000002 | 0.095 |
| 0.02150000000002 | 0.093 |
| 0.02155000000002 | 0.091 |
| 0.02160000000002 | 0.089 |
| 0.02165000000002 | 0.087 |
| 0.02170000000002 | 0.084 |
| 0.02175000000002 | 0.082 |
| 0.02180000000002 | 0.08 |
| 0.02185000000002 | 0.078 |
| 0.02190000000002 | 0.076 |
| 0.02195000000002 | 0.074 |
| 0.02200000000002 | 0.072 |
| 0.02205000000002 | 0.07 |
| 0.02210000000002 | 0.068 |
| 0.02215000000002 | 0.066 |
| 0.02220000000002 | 0.064 |
| 0.02225000000002 | 0.063 |
| 0.02230000000002 | 0.061 |
| 0.02235000000002 | 0.059 |
| 0.02240000000002 | 0.057 |
| 0.022450000000021 | 0.055 |
| 0.022500000000021 | 0.053 |
| 0.022550000000021 | 0.051 |
| 0.022600000000021 | 0.05 |
| 0.022650000000021 | 0.048 |
| 0.022700000000021 | 0.046 |
| 0.022750000000021 | 0.045 |
| 0.022800000000021 | 0.043 |
| 0.022850000000021 | 0.041 |
| 0.022900000000021 | 0.04 |
| 0.022950000000021 | 0.038 |
| 0.023000000000021 | 0.036 |
| 0.023050000000021 | 0.035 |
| 0.023100000000021 | 0.033 |
| 0.023150000000021 | 0.032 |
| 0.023200000000021 | 0.03 |
| 0.023250000000021 | 0.029 |
| 0.023300000000021 | 0.028 |
| 0.023350000000021 | 0.026 |
| 0.023400000000021 | 0.025 |
| 0.023450000000021 | 0.024 |
| 0.023500000000021 | 0.022 |
| 0.023550000000021 | 0.021 |
| 0.023600000000021 | 0.02 |
| 0.023650000000021 | 0.019 |
| 0.023700000000021 | 0.018 |
| 0.023750000000021 | 0.017 |
| 0.023800000000021 | 0.016 |
| 0.023850000000021 | 0.015 |
| 0.023900000000021 | 0.014 |
| 0.023950000000021 | 0.013 |
| 0.024000000000021 | 0.012 |
| 0.024050000000021 | 0.011 |
| 0.024100000000021 | 0.01 |
| 0.024150000000021 | 0.009 |
| 0.024200000000021 | 0.008 |
| 0.024250000000021 | 0.008 |
| 0.024300000000021 | 0.007 |
| 0.024350000000021 | 0.006 |
| 0.024400000000021 | 0.006 |
| 0.024450000000021 | 0.005 |
| 0.024500000000021 | 0.004 |
| 0.024550000000021 | 0.004 |
| 0.024600000000021 | 0.003 |
| 0.024650000000021 | 0.003 |
| 0.024700000000021 | 0.003 |
| 0.024750000000021 | 0.002 |
| 0.024800000000021 | 0.002 |
| 0.024850000000021 | 0.001 |
| 0.024900000000021 | 0.001 |
| 0.024950000000021 | 0.001 |
| 0.025000000000021 | 0.001 |
| 0.025050000000021 | 0 |
| 0.025100000000021 | 0 |
| 0.025150000000021 | 0 |
| 0.025200000000021 | 0 |
| 0.025250000000021 | 0 |
| 0.025300000000021 | 0 |
| 0.025350000000021 | 0 |
| 0.025400000000021 | 0 |
| 0.025450000000021 | 0 |
| 0.025500000000021 | 0 |
| 0.025550000000021 | 0 |
| 0.025600000000021 | 0 |
| 0.025650000000021 | 0.001 |
| 0.025700000000021 | 0.001 |
| 0.025750000000021 | 0.001 |
| 0.025800000000021 | 0.001 |
| 0.025850000000021 | 0.002 |
| 0.025900000000021 | 0.002 |
| 0.025950000000021 | 0.002 |
| 0.026000000000021 | 0.003 |
| 0.026050000000021 | 0.003 |
| 0.026100000000021 | 0.004 |
| 0.026150000000021 | 0.004 |
| 0.026200000000021 | 0.004 |
| 0.026250000000021 | 0.005 |
| 0.026300000000021 | 0.005 |
| 0.026350000000021 | 0.006 |
| 0.026400000000021 | 0.007 |
| 0.026450000000021 | 0.007 |
| 0.026500000000021 | 0.008 |
| 0.026550000000021 | 0.008 |
| 0.026600000000021 | 0.009 |
| 0.026650000000021 | 0.01 |
| 0.026700000000021 | 0.01 |
| 0.026750000000021 | 0.011 |
| 0.026800000000021 | 0.012 |
| 0.026850000000021 | 0.012 |
| 0.026900000000021 | 0.013 |
| 0.026950000000021 | 0.014 |
| 0.027000000000021 | 0.015 |
| 0.027050000000021 | 0.015 |
| 0.027100000000021 | 0.016 |
| 0.027150000000021 | 0.017 |
| 0.027200000000021 | 0.018 |
| 0.027250000000021 | 0.019 |
| 0.027300000000021 | 0.019 |
| 0.027350000000021 | 0.02 |
| 0.027400000000021 | 0.021 |
| 0.027450000000021 | 0.022 |
| 0.027500000000021 | 0.023 |
| 0.027550000000021 | 0.024 |
| 0.027600000000021 | 0.024 |
| 0.027650000000021 | 0.025 |
| 0.027700000000021 | 0.026 |
| 0.027750000000021 | 0.027 |
| 0.027800000000021 | 0.028 |
| 0.027850000000021 | 0.029 |
| 0.027900000000021 | 0.03 |
| 0.027950000000021 | 0.031 |
| 0.028000000000021 | 0.031 |
| 0.028050000000021 | 0.032 |
| 0.028100000000021 | 0.033 |
| 0.028150000000021 | 0.034 |
| 0.028200000000021 | 0.035 |
| 0.028250000000021 | 0.036 |
| 0.028300000000021 | 0.037 |
| 0.028350000000022 | 0.038 |
| 0.028400000000021 | 0.039 |
| 0.028450000000021 | 0.039 |
| 0.028500000000022 | 0.04 |
| 0.028550000000022 | 0.041 |
| 0.028600000000022 | 0.042 |
| 0.028650000000022 | 0.043 |
| 0.028700000000022 | 0.044 |
| 0.028750000000022 | 0.044 |
| 0.028800000000022 | 0.045 |
| 0.028850000000022 | 0.046 |
| 0.028900000000022 | 0.047 |
| 0.028950000000022 | 0.048 |
| 0.029000000000022 | 0.048 |
| 0.029050000000022 | 0.049 |
| 0.029100000000022 | 0.05 |
| 0.029150000000022 | 0.051 |
| 0.029200000000022 | 0.051 |
| 0.029250000000022 | 0.052 |
| 0.029300000000022 | 0.053 |
| 0.029350000000022 | 0.053 |
| 0.029400000000022 | 0.054 |
| 0.029450000000022 | 0.055 |
| 0.029500000000022 | 0.055 |
| 0.029550000000022 | 0.056 |
| 0.029600000000022 | 0.057 |
| 0.029650000000022 | 0.057 |
| 0.029700000000022 | 0.058 |
| 0.029750000000022 | 0.058 |
| 0.029800000000022 | 0.059 |
| 0.029850000000022 | 0.059 |
| 0.029900000000022 | 0.06 |
| 0.029950000000022 | 0.06 |
| 0.030000000000022 | 0.061 |
| 0.030050000000022 | 0.061 |
| 0.030100000000022 | 0.062 |
| 0.030150000000022 | 0.062 |
| 0.030200000000022 | 0.062 |
| 0.030250000000022 | 0.063 |
| 0.030300000000022 | 0.063 |
| 0.030350000000022 | 0.063 |
| 0.030400000000022 | 0.064 |
| 0.030450000000022 | 0.064 |
| 0.030500000000022 | 0.064 |
| 0.030550000000022 | 0.065 |
| 0.030600000000022 | 0.065 |
| 0.030650000000022 | 0.065 |
| 0.030700000000022 | 0.065 |
| 0.030750000000022 | 0.065 |
| 0.030800000000022 | 0.065 |
| 0.030850000000022 | 0.066 |
| 0.030900000000022 | 0.066 |
| 0.030950000000022 | 0.066 |
| 0.031000000000022 | 0.066 |
| 0.031050000000022 | 0.066 |
| 0.031100000000022 | 0.066 |
| 0.031150000000022 | 0.066 |
| 0.031200000000022 | 0.066 |
| 0.031250000000022 | 0.066 |
| 0.031300000000022 | 0.066 |
| 0.031350000000022 | 0.066 |
| 0.031400000000022 | 0.066 |
| 0.031450000000022 | 0.066 |
| 0.031500000000022 | 0.065 |
| 0.031550000000022 | 0.065 |
| 0.031600000000022 | 0.065 |
| 0.031650000000022 | 0.065 |
| 0.031700000000022 | 0.065 |
| 0.031750000000022 | 0.064 |
| 0.031800000000022 | 0.064 |
| 0.031850000000022 | 0.064 |
| 0.031900000000022 | 0.064 |
| 0.031950000000022 | 0.063 |
| 0.032000000000022 | 0.063 |
| 0.032050000000022 | 0.063 |
| 0.032100000000022 | 0.062 |
| 0.032150000000022 | 0.062 |
| 0.032200000000022 | 0.062 |
| 0.032250000000022 | 0.061 |
| 0.032300000000022 | 0.061 |
| 0.032350000000022 | 0.06 |
| 0.032400000000022 | 0.06 |
| 0.032450000000022 | 0.059 |
| 0.032500000000022 | 0.059 |
| 0.032550000000022 | 0.058 |
| 0.032600000000022 | 0.058 |
| 0.032650000000022 | 0.057 |
| 0.032700000000022 | 0.057 |
| 0.032750000000022 | 0.056 |
| 0.032800000000022 | 0.056 |
| 0.032850000000022 | 0.055 |
| 0.032900000000022 | 0.054 |
| 0.032950000000022 | 0.054 |
| 0.033000000000022 | 0.053 |
| 0.033050000000022 | 0.053 |
| 0.033100000000022 | 0.052 |
| 0.033150000000022 | 0.051 |
| 0.033200000000022 | 0.051 |
| 0.033250000000022 | 0.05 |
| 0.033300000000022 | 0.049 |
| 0.033350000000022 | 0.049 |
| 0.033400000000022 | 0.048 |
| 0.033450000000022 | 0.047 |
| 0.033500000000022 | 0.047 |
| 0.033550000000022 | 0.046 |
| 0.033600000000022 | 0.045 |
| 0.033650000000022 | 0.044 |
| 0.033700000000022 | 0.044 |
| 0.033750000000022 | 0.043 |
| 0.033800000000022 | 0.042 |
| 0.033850000000022 | 0.042 |
| 0.033900000000022 | 0.041 |
| 0.033950000000022 | 0.04 |
| 0.034000000000022 | 0.039 |
| 0.034050000000022 | 0.038 |
| 0.034100000000022 | 0.038 |
| 0.034150000000022 | 0.037 |
| 0.034200000000022 | 0.036 |
| 0.034250000000022 | 0.035 |
| 0.034300000000022 | 0.035 |
| 0.034350000000023 | 0.034 |
| 0.034400000000023 | 0.033 |
| 0.034450000000022 | 0.032 |
| 0.034500000000023 | 0.032 |
| 0.034550000000023 | 0.031 |
| 0.034600000000023 | 0.03 |
| 0.034650000000023 | 0.029 |
| 0.034700000000023 | 0.029 |
| 0.034750000000023 | 0.028 |
| 0.034800000000023 | 0.027 |
| 0.034850000000023 | 0.026 |
| 0.034900000000023 | 0.026 |
| 0.034950000000023 | 0.025 |
| 0.035000000000023 | 0.024 |
| 0.035050000000023 | 0.023 |
| 0.035100000000023 | 0.023 |
| 0.035150000000023 | 0.022 |
| 0.035200000000023 | 0.021 |
| 0.035250000000023 | 0.021 |
| 0.035300000000023 | 0.02 |
| 0.035350000000023 | 0.019 |
| 0.035400000000023 | 0.019 |
| 0.035450000000023 | 0.018 |
| 0.035500000000023 | 0.017 |
| 0.035550000000023 | 0.017 |
| 0.035600000000023 | 0.016 |
| 0.035650000000023 | 0.015 |
| 0.035700000000023 | 0.015 |
| 0.035750000000023 | 0.014 |
| 0.035800000000023 | 0.014 |
| 0.035850000000023 | 0.013 |
| 0.035900000000023 | 0.012 |
| 0.035950000000023 | 0.012 |
| 0.036000000000023 | 0.011 |
| 0.036050000000023 | 0.011 |
| 0.036100000000023 | 0.01 |
| 0.036150000000023 | 0.01 |
| 0.036200000000023 | 0.009 |
| 0.036250000000023 | 0.009 |
| 0.036300000000023 | 0.008 |
| 0.036350000000023 | 0.008 |
| 0.036400000000023 | 0.007 |
| 0.036450000000023 | 0.007 |
| 0.036500000000023 | 0.006 |
| 0.036550000000023 | 0.006 |
| 0.036600000000023 | 0.006 |
| 0.036650000000023 | 0.005 |
| 0.036700000000023 | 0.005 |
| 0.036750000000023 | 0.004 |
| 0.036800000000023 | 0.004 |
| 0.036850000000023 | 0.004 |
| 0.036900000000023 | 0.003 |
| 0.036950000000023 | 0.003 |
| 0.037000000000023 | 0.003 |
| 0.037050000000023 | 0.003 |
| 0.037100000000023 | 0.002 |
| 0.037150000000023 | 0.002 |
| 0.037200000000023 | 0.002 |
| 0.037250000000023 | 0.002 |
| 0.037300000000023 | 0.001 |
| 0.037350000000023 | 0.001 |
| 0.037400000000023 | 0.001 |
| 0.037450000000023 | 0.001 |
| 0.037500000000023 | 0.001 |
| 0.037550000000023 | 0.001 |
| 0.037600000000023 | 0 |
| 0.037650000000023 | 0 |
| 0.037700000000023 | 0 |
| 0.037750000000023 | 0 |
| 0.037800000000023 | 0 |
| 0.037850000000023 | 0 |
| 0.037900000000023 | 0 |
| 0.037950000000023 | 0 |
| 0.038000000000023 | 0 |
| 0.038050000000023 | 0 |
| 0.038100000000023 | 0 |
| 0.038150000000023 | 0 |
| 0.038200000000023 | 0 |
| 0.038250000000023 | 0 |
| 0.038300000000023 | 0 |
| 0.038350000000023 | 0 |
| 0.038400000000023 | 0 |
| 0.038450000000023 | 0.001 |
| 0.038500000000023 | 0.001 |
| 0.038550000000023 | 0.001 |
| 0.038600000000023 | 0.001 |
| 0.038650000000023 | 0.001 |
| 0.038700000000023 | 0.001 |
| 0.038750000000023 | 0.002 |
| 0.038800000000023 | 0.002 |
| 0.038850000000023 | 0.002 |
| 0.038900000000023 | 0.002 |
| 0.038950000000023 | 0.002 |
| 0.039000000000023 | 0.003 |
| 0.039050000000023 | 0.003 |
| 0.039100000000023 | 0.003 |
| 0.039150000000023 | 0.003 |
| 0.039200000000023 | 0.004 |
| 0.039250000000023 | 0.004 |
| 0.039300000000023 | 0.004 |
| 0.039350000000023 | 0.005 |
| 0.039400000000023 | 0.005 |
| 0.039450000000023 | 0.005 |
| 0.039500000000023 | 0.006 |
| 0.039550000000023 | 0.006 |
| 0.039600000000023 | 0.006 |
| 0.039650000000023 | 0.007 |
| 0.039700000000023 | 0.007 |
| 0.039750000000023 | 0.007 |
| 0.039800000000023 | 0.008 |
| 0.039850000000023 | 0.008 |
| 0.039900000000023 | 0.008 |
| 0.039950000000023 | 0.009 |
| 0.040000000000023 | 0.009 |
| 0.040050000000023 | 0.01 |
| 0.040100000000023 | 0.01 |
| 0.040150000000023 | 0.011 |
| 0.040200000000023 | 0.011 |
| 0.040250000000023 | 0.011 |
| 0.040300000000023 | 0.012 |
| 0.040350000000024 | 0.012 |
| 0.040400000000024 | 0.013 |
| 0.040450000000024 | 0.013 |
| 0.040500000000024 | 0.013 |
| 0.040550000000024 | 0.014 |
| 0.040600000000024 | 0.014 |
| 0.040650000000024 | 0.015 |
| 0.040700000000024 | 0.015 |
| 0.040750000000024 | 0.016 |
| 0.040800000000024 | 0.016 |
| 0.040850000000024 | 0.017 |
| 0.040900000000024 | 0.017 |
| 0.040950000000024 | 0.017 |
| 0.041000000000024 | 0.018 |
| 0.041050000000024 | 0.018 |
| 0.041100000000024 | 0.019 |
| 0.041150000000024 | 0.019 |
| 0.041200000000024 | 0.02 |
| 0.041250000000024 | 0.02 |
| 0.041300000000024 | 0.02 |
| 0.041350000000024 | 0.021 |
| 0.041400000000024 | 0.021 |
| 0.041450000000024 | 0.022 |
| 0.041500000000024 | 0.022 |
| 0.041550000000024 | 0.022 |
| 0.041600000000024 | 0.023 |
| 0.041650000000024 | 0.023 |
| 0.041700000000024 | 0.024 |
| 0.041750000000024 | 0.024 |
| 0.041800000000024 | 0.024 |
| 0.041850000000024 | 0.025 |
| 0.041900000000024 | 0.025 |
| 0.041950000000024 | 0.026 |
| 0.042000000000024 | 0.026 |
| 0.042050000000024 | 0.026 |
| 0.042100000000024 | 0.027 |
| 0.042150000000024 | 0.027 |
| 0.042200000000024 | 0.027 |
| 0.042250000000024 | 0.028 |
| 0.042300000000024 | 0.028 |
| 0.042350000000024 | 0.028 |
| 0.042400000000024 | 0.029 |
| 0.042450000000024 | 0.029 |
| 0.042500000000024 | 0.029 |
| 0.042550000000024 | 0.029 |
| 0.042600000000024 | 0.03 |
| 0.042650000000024 | 0.03 |
| 0.042700000000024 | 0.03 |
| 0.042750000000024 | 0.03 |
| 0.042800000000024 | 0.031 |
| 0.042850000000024 | 0.031 |
| 0.042900000000024 | 0.031 |
| 0.042950000000024 | 0.031 |
| 0.043000000000024 | 0.031 |
| 0.043050000000024 | 0.032 |
| 0.043100000000024 | 0.032 |
| 0.043150000000024 | 0.032 |
| 0.043200000000024 | 0.032 |
| 0.043250000000024 | 0.032 |
| 0.043300000000024 | 0.032 |
| 0.043350000000024 | 0.033 |
| 0.043400000000024 | 0.033 |
| 0.043450000000024 | 0.033 |
| 0.043500000000024 | 0.033 |
| 0.043550000000024 | 0.033 |
| 0.043600000000024 | 0.033 |
| 0.043650000000024 | 0.033 |
| 0.043700000000024 | 0.033 |
| 0.043750000000024 | 0.033 |
| 0.043800000000024 | 0.033 |
| 0.043850000000024 | 0.033 |
| 0.043900000000024 | 0.033 |
| 0.043950000000024 | 0.033 |
| 0.044000000000024 | 0.033 |
| 0.044050000000024 | 0.033 |
| 0.044100000000024 | 0.033 |
| 0.044150000000024 | 0.033 |
| 0.044200000000024 | 0.033 |
| 0.044250000000024 | 0.033 |
| 0.044300000000024 | 0.033 |
| 0.044350000000024 | 0.033 |
| 0.044400000000024 | 0.033 |
| 0.044450000000024 | 0.033 |
| 0.044500000000024 | 0.033 |
| 0.044550000000024 | 0.033 |
| 0.044600000000024 | 0.033 |
| 0.044650000000024 | 0.032 |
| 0.044700000000024 | 0.032 |
| 0.044750000000024 | 0.032 |
| 0.044800000000024 | 0.032 |
| 0.044850000000024 | 0.032 |
| 0.044900000000024 | 0.032 |
| 0.044950000000024 | 0.031 |
| 0.045000000000024 | 0.031 |
| 0.045050000000024 | 0.031 |
| 0.045100000000024 | 0.031 |
| 0.045150000000024 | 0.031 |
| 0.045200000000024 | 0.03 |
| 0.045250000000024 | 0.03 |
| 0.045300000000024 | 0.03 |
| 0.045350000000024 | 0.03 |
| 0.045400000000024 | 0.029 |
| 0.045450000000024 | 0.029 |
| 0.045500000000024 | 0.029 |
| 0.045550000000024 | 0.029 |
| 0.045600000000024 | 0.028 |
| 0.045650000000024 | 0.028 |
| 0.045700000000024 | 0.028 |
| 0.045750000000024 | 0.027 |
| 0.045800000000024 | 0.027 |
| 0.045850000000024 | 0.027 |
| 0.045900000000024 | 0.026 |
| 0.045950000000024 | 0.026 |
| 0.046000000000024 | 0.026 |
| 0.046050000000024 | 0.025 |
| 0.046100000000024 | 0.025 |
| 0.046150000000024 | 0.025 |
| 0.046200000000024 | 0.024 |
| 0.046250000000024 | 0.024 |
| 0.046300000000024 | 0.024 |
| 0.046350000000025 | 0.023 |
| 0.046400000000025 | 0.023 |
| 0.046450000000025 | 0.023 |
| 0.046500000000025 | 0.022 |
| 0.046550000000025 | 0.022 |
| 0.046600000000025 | 0.021 |
| 0.046650000000025 | 0.021 |
| 0.046700000000025 | 0.021 |
| 0.046750000000025 | 0.02 |
| 0.046800000000025 | 0.02 |
| 0.046850000000025 | 0.019 |
| 0.046900000000025 | 0.019 |
| 0.046950000000025 | 0.019 |
| 0.047000000000025 | 0.018 |
| 0.047050000000025 | 0.018 |
| 0.047100000000025 | 0.017 |
| 0.047150000000025 | 0.017 |
| 0.047200000000025 | 0.017 |
| 0.047250000000025 | 0.016 |
| 0.047300000000025 | 0.016 |
| 0.047350000000025 | 0.016 |
| 0.047400000000025 | 0.015 |
| 0.047450000000025 | 0.015 |
| 0.047500000000025 | 0.014 |
| 0.047550000000025 | 0.014 |
| 0.047600000000025 | 0.014 |
| 0.047650000000025 | 0.013 |
| 0.047700000000025 | 0.013 |
| 0.047750000000025 | 0.012 |
| 0.047800000000025 | 0.012 |
| 0.047850000000025 | 0.012 |
| 0.047900000000025 | 0.011 |
| 0.047950000000025 | 0.011 |
| 0.048000000000025 | 0.011 |
| 0.048050000000025 | 0.01 |
| 0.048100000000025 | 0.01 |
| 0.048150000000025 | 0.01 |
| 0.048200000000025 | 0.009 |
| 0.048250000000025 | 0.009 |
| 0.048300000000025 | 0.009 |
| 0.048350000000025 | 0.008 |
| 0.048400000000025 | 0.008 |
| 0.048450000000025 | 0.008 |
| 0.048500000000025 | 0.007 |
| 0.048550000000025 | 0.007 |
| 0.048600000000025 | 0.007 |
| 0.048650000000025 | 0.006 |
| 0.048700000000025 | 0.006 |
| 0.048750000000025 | 0.006 |
| 0.048800000000025 | 0.005 |
| 0.048850000000025 | 0.005 |
| 0.048900000000025 | 0.005 |
| 0.048950000000025 | 0.005 |
| 0.049000000000025 | 0.004 |
| 0.049050000000025 | 0.004 |
| 0.049100000000025 | 0.004 |
| 0.049150000000025 | 0.004 |
| 0.049200000000025 | 0.003 |
| 0.049250000000025 | 0.003 |
| 0.049300000000025 | 0.003 |
| 0.049350000000025 | 0.003 |
| 0.049400000000025 | 0.003 |
| 0.049450000000025 | 0.002 |
| 0.049500000000025 | 0.002 |
| 0.049550000000025 | 0.002 |
| 0.049600000000025 | 0.002 |
| 0.049650000000025 | 0.002 |
| 0.049700000000025 | 0.001 |
| 0.049750000000025 | 0.001 |
| 0.049800000000025 | 0.001 |
| 0.049850000000025 | 0.001 |
| 0.049900000000025 | 0.001 |
| 0.049950000000025 | 0.001 |
| 0.050000000000025 | 0.001 |
| 0.050050000000025 | 0.001 |
| 0.050100000000025 | 0 |
| 0.050150000000025 | 0 |
| 0.050200000000025 | 0 |
| 0.050250000000025 | 0 |
| 0.050300000000025 | 0 |
| 0.050350000000025 | 0 |
| 0.050400000000025 | 0 |
| 0.050450000000025 | 0 |
| 0.050500000000025 | 0 |
| 0.050550000000025 | 0 |
| 0.050600000000025 | 0 |
| 0.050650000000025 | 0 |
| 0.050700000000025 | 0 |
| 0.050750000000025 | 0 |
| 0.050800000000025 | 0 |
| 0.050850000000025 | 0 |
| 0.050900000000025 | 0 |
| 0.050950000000025 | 0 |
| 0.051000000000025 | 0 |
| 0.051050000000025 | 0 |
| 0.051100000000025 | 0 |
| 0.051150000000025 | 0 |
| 0.051200000000025 | 0 |
| 0.051250000000025 | 0.001 |
| 0.051300000000025 | 0.001 |
| 0.051350000000025 | 0.001 |
| 0.051400000000025 | 0.001 |
| 0.051450000000025 | 0.001 |
| 0.051500000000025 | 0.001 |
| 0.051550000000025 | 0.001 |
| 0.051600000000025 | 0.001 |
| 0.051650000000025 | 0.001 |
| 0.051700000000025 | 0.002 |
| 0.051750000000025 | 0.002 |
| 0.051800000000025 | 0.002 |
| 0.051850000000025 | 0.002 |
| 0.051900000000025 | 0.002 |
| 0.051950000000025 | 0.002 |
| 0.052000000000025 | 0.003 |
| 0.052050000000025 | 0.003 |
| 0.052100000000025 | 0.003 |
| 0.052150000000025 | 0.003 |
| 0.052200000000025 | 0.003 |
| 0.052250000000025 | 0.004 |
| 0.052300000000025 | 0.004 |
| 0.052350000000026 | 0.004 |
| 0.052400000000026 | 0.004 |
| 0.052450000000026 | 0.004 |
| 0.052500000000026 | 0.005 |
| 0.052550000000026 | 0.005 |
| 0.052600000000026 | 0.005 |
| 0.052650000000026 | 0.005 |
| 0.052700000000026 | 0.005 |
| 0.052750000000026 | 0.006 |
| 0.052800000000026 | 0.006 |
| 0.052850000000026 | 0.006 |
| 0.052900000000026 | 0.006 |
| 0.052950000000026 | 0.007 |
| 0.053000000000026 | 0.007 |
| 0.053050000000026 | 0.007 |
| 0.053100000000026 | 0.007 |
| 0.053150000000026 | 0.008 |
| 0.053200000000026 | 0.008 |
| 0.053250000000026 | 0.008 |
| 0.053300000000026 | 0.008 |
| 0.053350000000026 | 0.009 |
| 0.053400000000026 | 0.009 |
| 0.053450000000026 | 0.009 |
| 0.053500000000026 | 0.01 |
| 0.053550000000026 | 0.01 |
| 0.053600000000026 | 0.01 |
| 0.053650000000026 | 0.01 |
| 0.053700000000026 | 0.011 |
| 0.053750000000026 | 0.011 |
| 0.053800000000026 | 0.011 |
| 0.053850000000026 | 0.011 |
| 0.053900000000026 | 0.012 |
| 0.053950000000026 | 0.012 |
| 0.054000000000026 | 0.012 |
| 0.054050000000026 | 0.012 |
| 0.054100000000026 | 0.013 |
| 0.054150000000026 | 0.013 |
| 0.054200000000026 | 0.013 |
| 0.054250000000026 | 0.013 |
| 0.054300000000026 | 0.014 |
| 0.054350000000026 | 0.014 |
| 0.054400000000026 | 0.014 |
| 0.054450000000026 | 0.014 |
| 0.054500000000026 | 0.015 |
| 0.054550000000026 | 0.015 |
| 0.054600000000026 | 0.015 |
| 0.054650000000026 | 0.015 |
| 0.054700000000026 | 0.015 |
| 0.054750000000026 | 0.016 |
| 0.054800000000026 | 0.016 |
| 0.054850000000026 | 0.016 |
| 0.054900000000026 | 0.016 |
| 0.054950000000026 | 0.016 |
| 0.055000000000026 | 0.017 |
| 0.055050000000026 | 0.017 |
| 0.055100000000026 | 0.017 |
| 0.055150000000026 | 0.017 |
| 0.055200000000026 | 0.017 |
| 0.055250000000026 | 0.018 |
| 0.055300000000026 | 0.018 |
| 0.055350000000026 | 0.018 |
| 0.055400000000026 | 0.018 |
| 0.055450000000026 | 0.018 |
| 0.055500000000026 | 0.018 |
| 0.055550000000026 | 0.018 |
| 0.055600000000026 | 0.019 |
| 0.055650000000026 | 0.019 |
| 0.055700000000026 | 0.019 |
| 0.055750000000026 | 0.019 |
| 0.055800000000026 | 0.019 |
| 0.055850000000026 | 0.019 |
| 0.055900000000026 | 0.019 |
| 0.055950000000026 | 0.019 |
| 0.056000000000026 | 0.019 |
| 0.056050000000026 | 0.02 |
| 0.056100000000026 | 0.02 |
| 0.056150000000026 | 0.02 |
| 0.056200000000026 | 0.02 |
| 0.056250000000026 | 0.02 |
| 0.056300000000026 | 0.02 |
| 0.056350000000026 | 0.02 |
| 0.056400000000026 | 0.02 |
| 0.056450000000026 | 0.02 |
| 0.056500000000026 | 0.02 |
| 0.056550000000026 | 0.02 |
| 0.056600000000026 | 0.02 |
| 0.056650000000026 | 0.02 |
| 0.056700000000026 | 0.02 |
| 0.056750000000026 | 0.02 |
| 0.056800000000026 | 0.02 |
| 0.056850000000026 | 0.02 |
| 0.056900000000026 | 0.02 |
| 0.056950000000026 | 0.02 |
| 0.057000000000026 | 0.02 |
| 0.057050000000026 | 0.02 |
| 0.057100000000026 | 0.02 |
| 0.057150000000026 | 0.02 |
| 0.057200000000026 | 0.02 |
| 0.057250000000026 | 0.02 |
| 0.057300000000026 | 0.02 |
| 0.057350000000026 | 0.02 |
| 0.057400000000026 | 0.02 |
| 0.057450000000026 | 0.019 |
| 0.057500000000026 | 0.019 |
| 0.057550000000026 | 0.019 |
| 0.057600000000026 | 0.019 |
| 0.057650000000026 | 0.019 |
| 0.057700000000026 | 0.019 |
| 0.057750000000026 | 0.019 |
| 0.057800000000026 | 0.019 |
| 0.057850000000026 | 0.019 |
| 0.057900000000026 | 0.018 |
| 0.057950000000026 | 0.018 |
| 0.058000000000026 | 0.018 |
| 0.058050000000026 | 0.018 |
| 0.058100000000026 | 0.018 |
| 0.058150000000026 | 0.018 |
| 0.058200000000026 | 0.018 |
| 0.058250000000026 | 0.017 |
| 0.058300000000027 | 0.017 |
| 0.058350000000027 | 0.017 |
| 0.058400000000027 | 0.017 |
| 0.058450000000027 | 0.017 |
| 0.058500000000027 | 0.016 |
| 0.058550000000027 | 0.016 |
| 0.058600000000027 | 0.016 |
| 0.058650000000027 | 0.016 |
| 0.058700000000027 | 0.016 |
| 0.058750000000027 | 0.016 |
| 0.058800000000027 | 0.015 |
| 0.058850000000027 | 0.015 |
| 0.058900000000027 | 0.015 |
| 0.058950000000027 | 0.015 |
| 0.059000000000027 | 0.014 |
| 0.059050000000027 | 0.014 |
| 0.059100000000027 | 0.014 |
| 0.059150000000027 | 0.014 |
| 0.059200000000027 | 0.014 |
| 0.059250000000027 | 0.013 |
| 0.059300000000027 | 0.013 |
| 0.059350000000027 | 0.013 |
| 0.059400000000027 | 0.013 |
| 0.059450000000027 | 0.012 |
| 0.059500000000027 | 0.012 |
| 0.059550000000027 | 0.012 |
| 0.059600000000027 | 0.012 |
| 0.059650000000027 | 0.011 |
| 0.059700000000027 | 0.011 |
| 0.059750000000027 | 0.011 |
| 0.059800000000027 | 0.011 |
| 0.059850000000027 | 0.011 |
| 0.059900000000027 | 0.01 |
| 0.059950000000027 | 0.01 |
| 0.060000000000027 | 0.01 |
| 0.060050000000027 | 0.01 |
| 0.060100000000027 | 0.009 |
| 0.060150000000027 | 0.009 |
| 0.060200000000027 | 0.009 |
| 0.060250000000027 | 0.009 |
| 0.060300000000027 | 0.008 |
| 0.060350000000027 | 0.008 |
| 0.060400000000027 | 0.008 |
| 0.060450000000027 | 0.008 |
| 0.060500000000027 | 0.007 |
| 0.060550000000027 | 0.007 |
| 0.060600000000027 | 0.007 |
| 0.060650000000027 | 0.007 |
| 0.060700000000027 | 0.007 |
| 0.060750000000027 | 0.006 |
| 0.060800000000027 | 0.006 |
| 0.060850000000027 | 0.006 |
| 0.060900000000027 | 0.006 |
| 0.060950000000027 | 0.005 |
| 0.061000000000027 | 0.005 |
| 0.061050000000027 | 0.005 |
| 0.061100000000027 | 0.005 |
| 0.061150000000027 | 0.005 |
| 0.061200000000027 | 0.004 |
| 0.061250000000027 | 0.004 |
| 0.061300000000027 | 0.004 |
| 0.061350000000027 | 0.004 |
| 0.061400000000027 | 0.004 |
| 0.061450000000027 | 0.004 |
| 0.061500000000027 | 0.003 |
| 0.061550000000027 | 0.003 |
| 0.061600000000027 | 0.003 |
| 0.061650000000027 | 0.003 |
| 0.061700000000027 | 0.003 |
| 0.061750000000027 | 0.003 |
| 0.061800000000027 | 0.002 |
| 0.061850000000027 | 0.002 |
| 0.061900000000027 | 0.002 |
| 0.061950000000027 | 0.002 |
| 0.062000000000027 | 0.002 |
| 0.062050000000027 | 0.002 |
| 0.062100000000027 | 0.002 |
| 0.062150000000027 | 0.001 |
| 0.062200000000027 | 0.001 |
| 0.062250000000027 | 0.001 |
| 0.062300000000027 | 0.001 |
| 0.062350000000027 | 0.001 |
| 0.062400000000027 | 0.001 |
| 0.062450000000027 | 0.001 |
| 0.062500000000027 | 0.001 |
| 0.062550000000027 | 0.001 |
| 0.062600000000027 | 0.001 |
| 0.062650000000027 | 0 |
| 0.062700000000027 | 0 |
| 0.062750000000027 | 0 |
| 0.062800000000027 | 0 |
| 0.062850000000027 | 0 |
| 0.062900000000027 | 0 |
| 0.062950000000027 | 0 |
| 0.063000000000027 | 0 |
| 0.063050000000027 | 0 |
| 0.063100000000027 | 0 |
| 0.063150000000027 | 0 |
| 0.063200000000027 | 0 |
| 0.063250000000027 | 0 |
| 0.063300000000027 | 0 |
| 0.063350000000027 | 0 |
| 0.063400000000027 | 0 |
| 0.063450000000027 | 0 |
| 0.063500000000027 | 0 |
| 0.063550000000027 | 0 |
| 0.063600000000027 | 0 |
| 0.063650000000027 | 0 |
| 0.063700000000027 | 0 |
| 0.063750000000027 | 0 |
| 0.063800000000027 | 0 |
| 0.063850000000027 | 0 |
| 0.063900000000027 | 0 |
| 0.063950000000027 | 0 |
| 0.064000000000027 | 0 |
| 0.064050000000027 | 0 |
| 0.064100000000027 | 0.001 |
| 0.064150000000027 | 0.001 |
| 0.064200000000027 | 0.001 |
| 0.064250000000027 | 0.001 |
| 0.064300000000028 | 0.001 |
| 0.064350000000028 | 0.001 |
| 0.064400000000028 | 0.001 |
| 0.064450000000028 | 0.001 |
| 0.064500000000028 | 0.001 |
| 0.064550000000028 | 0.001 |
| 0.064600000000028 | 0.001 |
| 0.064650000000028 | 0.002 |
| 0.064700000000028 | 0.002 |
| 0.064750000000028 | 0.002 |
| 0.064800000000028 | 0.002 |
| 0.064850000000028 | 0.002 |
| 0.064900000000028 | 0.002 |
| 0.064950000000028 | 0.002 |
| 0.065000000000028 | 0.002 |
| 0.065050000000028 | 0.003 |
| 0.065100000000028 | 0.003 |
| 0.065150000000028 | 0.003 |
| 0.065200000000028 | 0.003 |
| 0.065250000000028 | 0.003 |
| 0.065300000000028 | 0.003 |
| 0.065350000000028 | 0.003 |
| 0.065400000000028 | 0.004 |
| 0.065450000000028 | 0.004 |
| 0.065500000000028 | 0.004 |
| 0.065550000000028 | 0.004 |
| 0.065600000000028 | 0.004 |
| 0.065650000000028 | 0.004 |
| 0.065700000000028 | 0.005 |
| 0.065750000000028 | 0.005 |
| 0.065800000000028 | 0.005 |
| 0.065850000000028 | 0.005 |
| 0.065900000000028 | 0.005 |
| 0.065950000000028 | 0.005 |
| 0.066000000000028 | 0.006 |
| 0.066050000000028 | 0.006 |
| 0.066100000000028 | 0.006 |
| 0.066150000000028 | 0.006 |
| 0.066200000000028 | 0.006 |
| 0.066250000000028 | 0.006 |
| 0.066300000000028 | 0.007 |
| 0.066350000000028 | 0.007 |
| 0.066400000000028 | 0.007 |
| 0.066450000000028 | 0.007 |
| 0.066500000000028 | 0.007 |
| 0.066550000000028 | 0.007 |
| 0.066600000000028 | 0.008 |
| 0.066650000000028 | 0.008 |
| 0.066700000000028 | 0.008 |
| 0.066750000000028 | 0.008 |
| 0.066800000000028 | 0.008 |
| 0.066850000000028 | 0.008 |
| 0.066900000000028 | 0.009 |
| 0.066950000000028 | 0.009 |
| 0.067000000000028 | 0.009 |
| 0.067050000000028 | 0.009 |
| 0.067100000000028 | 0.009 |
| 0.067150000000028 | 0.009 |
| 0.067200000000028 | 0.01 |
| 0.067250000000028 | 0.01 |
| 0.067300000000028 | 0.01 |
| 0.067350000000028 | 0.01 |
| 0.067400000000028 | 0.01 |
| 0.067450000000028 | 0.01 |
| 0.067500000000028 | 0.01 |
| 0.067550000000028 | 0.011 |
| 0.067600000000028 | 0.011 |
| 0.067650000000028 | 0.011 |
| 0.067700000000028 | 0.011 |
| 0.067750000000028 | 0.011 |
| 0.067800000000028 | 0.011 |
| 0.067850000000028 | 0.011 |
| 0.067900000000028 | 0.012 |
| 0.067950000000028 | 0.012 |
| 0.068000000000028 | 0.012 |
| 0.068050000000028 | 0.012 |
| 0.068100000000028 | 0.012 |
| 0.068150000000028 | 0.012 |
| 0.068200000000028 | 0.012 |
| 0.068250000000028 | 0.012 |
| 0.068300000000028 | 0.012 |
| 0.068350000000028 | 0.012 |
| 0.068400000000028 | 0.013 |
| 0.068450000000028 | 0.013 |
| 0.068500000000028 | 0.013 |
| 0.068550000000028 | 0.013 |
| 0.068600000000028 | 0.013 |
| 0.068650000000028 | 0.013 |
| 0.068700000000028 | 0.013 |
| 0.068750000000028 | 0.013 |
| 0.068800000000028 | 0.013 |
| 0.068850000000028 | 0.013 |
| 0.068900000000028 | 0.013 |
| 0.068950000000028 | 0.013 |
| 0.069000000000028 | 0.013 |
| 0.069050000000028 | 0.013 |
| 0.069100000000028 | 0.013 |
| 0.069150000000028 | 0.013 |
| 0.069200000000028 | 0.013 |
| 0.069250000000028 | 0.013 |
| 0.069300000000028 | 0.013 |
| 0.069350000000028 | 0.013 |
| 0.069400000000028 | 0.013 |
| 0.069450000000028 | 0.013 |
| 0.069500000000028 | 0.013 |
| 0.069550000000028 | 0.013 |
| 0.069600000000028 | 0.013 |
| 0.069650000000028 | 0.013 |
| 0.069700000000028 | 0.013 |
| 0.069750000000028 | 0.013 |
| 0.069800000000028 | 0.013 |
| 0.069850000000028 | 0.013 |
| 0.069900000000028 | 0.013 |
| 0.069950000000028 | 0.013 |
| 0.070000000000028 | 0.013 |
| 0.070050000000028 | 0.013 |
| 0.070100000000028 | 0.013 |
| 0.070150000000029 | 0.013 |
| 0.070200000000028 | 0.013 |
| 0.070250000000028 | 0.013 |
| 0.070300000000029 | 0.013 |
| 0.070350000000029 | 0.013 |
| 0.070400000000029 | 0.013 |
| 0.070450000000029 | 0.013 |
| 0.070500000000029 | 0.013 |
| 0.070550000000029 | 0.012 |
| 0.070600000000029 | 0.012 |
| 0.070650000000029 | 0.012 |
| 0.070700000000029 | 0.012 |
| 0.070750000000029 | 0.012 |
| 0.070800000000029 | 0.012 |
| 0.070850000000029 | 0.012 |
| 0.070900000000029 | 0.012 |
| 0.070950000000029 | 0.012 |
| 0.071000000000029 | 0.012 |
| 0.071050000000029 | 0.011 |
| 0.071100000000029 | 0.011 |
| 0.071150000000029 | 0.011 |
| 0.071200000000029 | 0.011 |
| 0.071250000000029 | 0.011 |
| 0.071300000000029 | 0.011 |
| 0.071350000000029 | 0.011 |
| 0.071400000000029 | 0.011 |
| 0.071450000000029 | 0.01 |
| 0.071500000000029 | 0.01 |
| 0.071550000000029 | 0.01 |
| 0.071600000000029 | 0.01 |
| 0.071650000000029 | 0.01 |
| 0.071700000000029 | 0.01 |
| 0.071750000000029 | 0.01 |
| 0.071800000000029 | 0.009 |
| 0.071850000000029 | 0.009 |
| 0.071900000000029 | 0.009 |
| 0.071950000000029 | 0.009 |
| 0.072000000000029 | 0.009 |
| 0.072050000000029 | 0.009 |
| 0.072100000000029 | 0.009 |
| 0.072150000000029 | 0.008 |
| 0.072200000000029 | 0.008 |
| 0.072250000000029 | 0.008 |
| 0.072300000000029 | 0.008 |
| 0.072350000000029 | 0.008 |
| 0.072400000000029 | 0.008 |
| 0.072450000000029 | 0.007 |
| 0.072500000000029 | 0.007 |
| 0.072550000000029 | 0.007 |
| 0.072600000000029 | 0.007 |
| 0.072650000000029 | 0.007 |
| 0.072700000000029 | 0.007 |
| 0.072750000000029 | 0.006 |
| 0.072800000000029 | 0.006 |
| 0.072850000000029 | 0.006 |
| 0.072900000000029 | 0.006 |
| 0.072950000000029 | 0.006 |
| 0.073000000000029 | 0.006 |
| 0.073050000000029 | 0.006 |
| 0.073100000000029 | 0.005 |
| 0.073150000000029 | 0.005 |
| 0.073200000000029 | 0.005 |
| 0.073250000000029 | 0.005 |
| 0.073300000000029 | 0.005 |
| 0.073350000000029 | 0.005 |
| 0.073400000000029 | 0.004 |
| 0.073450000000029 | 0.004 |
| 0.073500000000029 | 0.004 |
| 0.073550000000029 | 0.004 |
| 0.073600000000029 | 0.004 |
| 0.073650000000029 | 0.004 |
| 0.073700000000029 | 0.004 |
| 0.073750000000029 | 0.003 |
| 0.073800000000029 | 0.003 |
| 0.073850000000029 | 0.003 |
| 0.073900000000029 | 0.003 |
| 0.073950000000029 | 0.003 |
| 0.074000000000029 | 0.003 |
| 0.074050000000029 | 0.003 |
| 0.074100000000029 | 0.003 |
| 0.074150000000029 | 0.002 |
| 0.074200000000029 | 0.002 |
| 0.074250000000029 | 0.002 |
| 0.074300000000029 | 0.002 |
| 0.074350000000029 | 0.002 |
| 0.074400000000029 | 0.002 |
| 0.074450000000029 | 0.002 |
| 0.074500000000029 | 0.002 |
| 0.074550000000029 | 0.002 |
| 0.074600000000029 | 0.001 |
| 0.074650000000029 | 0.001 |
| 0.074700000000029 | 0.001 |
| 0.074750000000029 | 0.001 |
| 0.074800000000029 | 0.001 |
| 0.074850000000029 | 0.001 |
| 0.074900000000029 | 0.001 |
| 0.074950000000029 | 0.001 |
| 0.075000000000029 | 0.001 |
| 0.075050000000029 | 0.001 |
| 0.075100000000029 | 0.001 |
| 0.075150000000029 | 0.001 |
| 0.075200000000029 | 0 |
| 0.075250000000029 | 0 |
| 0.075300000000029 | 0 |
| 0.075350000000029 | 0 |
| 0.075400000000029 | 0 |
| 0.075450000000029 | 0 |
| 0.075500000000029 | 0 |
| 0.075550000000029 | 0 |
| 0.075600000000029 | 0 |
| 0.075650000000029 | 0 |
| 0.075700000000029 | 0 |
| 0.075750000000029 | 0 |
| 0.075800000000029 | 0 |
| 0.075850000000029 | 0 |
| 0.075900000000029 | 0 |
| 0.075950000000029 | 0 |
| 0.076000000000029 | 0 |
| 0.076050000000029 | 0 |
| 0.076100000000029 | 0 |
| 0.07615000000003 | 0 |
| 0.076200000000029 | 0 |
| 0.076250000000029 | 0 |
| 0.07630000000003 | 0 |
| 0.07635000000003 | 0 |
| 0.07640000000003 | 0 |
| 0.07645000000003 | 0 |
| 0.07650000000003 | 0 |
| 0.07655000000003 | 0 |
| 0.07660000000003 | 0 |
| 0.07665000000003 | 0 |
| 0.07670000000003 | 0 |
| 0.07675000000003 | 0 |
| 0.07680000000003 | 0 |
| 0.07685000000003 | 0 |
| 0.07690000000003 | 0 |
| 0.07695000000003 | 0.001 |
| 0.07700000000003 | 0.001 |
| 0.07705000000003 | 0.001 |
| 0.07710000000003 | 0.001 |
| 0.07715000000003 | 0.001 |
| 0.07720000000003 | 0.001 |
| 0.07725000000003 | 0.001 |
| 0.07730000000003 | 0.001 |
| 0.07735000000003 | 0.001 |
| 0.07740000000003 | 0.001 |
| 0.07745000000003 | 0.001 |
| 0.07750000000003 | 0.001 |
| 0.07755000000003 | 0.001 |
| 0.07760000000003 | 0.002 |
| 0.07765000000003 | 0.002 |
| 0.07770000000003 | 0.002 |
| 0.07775000000003 | 0.002 |
| 0.07780000000003 | 0.002 |
| 0.07785000000003 | 0.002 |
| 0.07790000000003 | 0.002 |
| 0.07795000000003 | 0.002 |
| 0.07800000000003 | 0.002 |
| 0.07805000000003 | 0.002 |
| 0.07810000000003 | 0.003 |
| 0.07815000000003 | 0.003 |
| 0.07820000000003 | 0.003 |
| 0.07825000000003 | 0.003 |
| 0.07830000000003 | 0.003 |
| 0.07835000000003 | 0.003 |
| 0.07840000000003 | 0.003 |
| 0.07845000000003 | 0.003 |
| 0.07850000000003 | 0.003 |
| 0.07855000000003 | 0.004 |
| 0.07860000000003 | 0.004 |
| 0.07865000000003 | 0.004 |
| 0.07870000000003 | 0.004 |
| 0.07875000000003 | 0.004 |
| 0.07880000000003 | 0.004 |
| 0.07885000000003 | 0.004 |
| 0.07890000000003 | 0.004 |
| 0.07895000000003 | 0.005 |
| 0.07900000000003 | 0.005 |
| 0.07905000000003 | 0.005 |
| 0.07910000000003 | 0.005 |
| 0.07915000000003 | 0.005 |
| 0.07920000000003 | 0.005 |
| 0.07925000000003 | 0.005 |
| 0.07930000000003 | 0.005 |
| 0.07935000000003 | 0.006 |
| 0.07940000000003 | 0.006 |
| 0.07945000000003 | 0.006 |
| 0.07950000000003 | 0.006 |
| 0.07955000000003 | 0.006 |
| 0.07960000000003 | 0.006 |
| 0.07965000000003 | 0.006 |
| 0.07970000000003 | 0.006 |
| 0.07975000000003 | 0.006 |
| 0.07980000000003 | 0.007 |
| 0.07985000000003 | 0.007 |
| 0.07990000000003 | 0.007 |
| 0.07995000000003 | 0.007 |
| 0.08000000000003 | 0.007 |
| 0.08005000000003 | 0.007 |
| 0.08010000000003 | 0.007 |
| 0.08015000000003 | 0.007 |
| 0.08020000000003 | 0.007 |
| 0.08025000000003 | 0.008 |
| 0.08030000000003 | 0.008 |
| 0.08035000000003 | 0.008 |
| 0.08040000000003 | 0.008 |
| 0.08045000000003 | 0.008 |
| 0.08050000000003 | 0.008 |
| 0.08055000000003 | 0.008 |
| 0.08060000000003 | 0.008 |
| 0.08065000000003 | 0.008 |
| 0.08070000000003 | 0.008 |
| 0.08075000000003 | 0.008 |
| 0.08080000000003 | 0.009 |
| 0.08085000000003 | 0.009 |
| 0.08090000000003 | 0.009 |
| 0.08095000000003 | 0.009 |
| 0.08100000000003 | 0.009 |
| 0.08105000000003 | 0.009 |
| 0.08110000000003 | 0.009 |
| 0.08115000000003 | 0.009 |
| 0.08120000000003 | 0.009 |
| 0.08125000000003 | 0.009 |
| 0.08130000000003 | 0.009 |
| 0.08135000000003 | 0.009 |
| 0.08140000000003 | 0.009 |
| 0.08145000000003 | 0.009 |
| 0.08150000000003 | 0.009 |
| 0.08155000000003 | 0.009 |
| 0.08160000000003 | 0.009 |
| 0.08165000000003 | 0.009 |
| 0.08170000000003 | 0.009 |
| 0.08175000000003 | 0.01 |
| 0.08180000000003 | 0.01 |
| 0.08185000000003 | 0.01 |
| 0.08190000000003 | 0.01 |
| 0.08195000000003 | 0.01 |
| 0.08200000000003 | 0.01 |
| 0.08205000000003 | 0.01 |
| 0.08210000000003 | 0.01 |
| 0.082150000000031 | 0.01 |
| 0.082200000000031 | 0.01 |
| 0.08225000000003 | 0.01 |
| 0.082300000000031 | 0.01 |
| 0.082350000000031 | 0.01 |
| 0.082400000000031 | 0.01 |
| 0.082450000000031 | 0.01 |
| 0.082500000000031 | 0.01 |
| 0.082550000000031 | 0.01 |
| 0.082600000000031 | 0.01 |
| 0.082650000000031 | 0.009 |
| 0.082700000000031 | 0.009 |
| 0.082750000000031 | 0.009 |
| 0.082800000000031 | 0.009 |
| 0.082850000000031 | 0.009 |
| 0.082900000000031 | 0.009 |
| 0.082950000000031 | 0.009 |
| 0.083000000000031 | 0.009 |
| 0.083050000000031 | 0.009 |
| 0.083100000000031 | 0.009 |
| 0.083150000000031 | 0.009 |
| 0.083200000000031 | 0.009 |
| 0.083250000000031 | 0.009 |
| 0.083300000000031 | 0.009 |
| 0.083350000000031 | 0.009 |
| 0.083400000000031 | 0.009 |
| 0.083450000000031 | 0.009 |
| 0.083500000000031 | 0.009 |
| 0.083550000000031 | 0.009 |
| 0.083600000000031 | 0.008 |
| 0.083650000000031 | 0.008 |
| 0.083700000000031 | 0.008 |
| 0.083750000000031 | 0.008 |
| 0.083800000000031 | 0.008 |
| 0.083850000000031 | 0.008 |
| 0.083900000000031 | 0.008 |
| 0.083950000000031 | 0.008 |
| 0.084000000000031 | 0.008 |
| 0.084050000000031 | 0.008 |
| 0.084100000000031 | 0.008 |
| 0.084150000000031 | 0.008 |
| 0.084200000000031 | 0.007 |
| 0.084250000000031 | 0.007 |
| 0.084300000000031 | 0.007 |
| 0.084350000000031 | 0.007 |
| 0.084400000000031 | 0.007 |
| 0.084450000000031 | 0.007 |
| 0.084500000000031 | 0.007 |
| 0.084550000000031 | 0.007 |
| 0.084600000000031 | 0.007 |
| 0.084650000000031 | 0.007 |
| 0.084700000000031 | 0.006 |
| 0.084750000000031 | 0.006 |
| 0.084800000000031 | 0.006 |
| 0.084850000000031 | 0.006 |
| 0.084900000000031 | 0.006 |
| 0.084950000000031 | 0.006 |
| 0.085000000000031 | 0.006 |
| 0.085050000000031 | 0.006 |
| 0.085100000000031 | 0.006 |
| 0.085150000000031 | 0.005 |
| 0.085200000000031 | 0.005 |
| 0.085250000000031 | 0.005 |
| 0.085300000000031 | 0.005 |
| 0.085350000000031 | 0.005 |
| 0.085400000000031 | 0.005 |
| 0.085450000000031 | 0.005 |
| 0.085500000000031 | 0.005 |
| 0.085550000000031 | 0.004 |
| 0.085600000000031 | 0.004 |
| 0.085650000000031 | 0.004 |
| 0.085700000000031 | 0.004 |
| 0.085750000000031 | 0.004 |
| 0.085800000000031 | 0.004 |
| 0.085850000000031 | 0.004 |
| 0.085900000000031 | 0.004 |
| 0.085950000000031 | 0.004 |
| 0.086000000000031 | 0.003 |
| 0.086050000000031 | 0.003 |
| 0.086100000000031 | 0.003 |
| 0.086150000000031 | 0.003 |
| 0.086200000000031 | 0.003 |
| 0.086250000000031 | 0.003 |
| 0.086300000000031 | 0.003 |
| 0.086350000000031 | 0.003 |
| 0.086400000000031 | 0.003 |
| 0.086450000000031 | 0.002 |
| 0.086500000000031 | 0.002 |
| 0.086550000000031 | 0.002 |
| 0.086600000000031 | 0.002 |
| 0.086650000000031 | 0.002 |
| 0.086700000000031 | 0.002 |
| 0.086750000000031 | 0.002 |
| 0.086800000000031 | 0.002 |
| 0.086850000000031 | 0.002 |
| 0.086900000000031 | 0.002 |
| 0.086950000000031 | 0.002 |
| 0.087000000000031 | 0.001 |
| 0.087050000000031 | 0.001 |
| 0.087100000000031 | 0.001 |
| 0.087150000000031 | 0.001 |
| 0.087200000000031 | 0.001 |
| 0.087250000000031 | 0.001 |
| 0.087300000000031 | 0.001 |
| 0.087350000000031 | 0.001 |
| 0.087400000000031 | 0.001 |
| 0.087450000000031 | 0.001 |
| 0.087500000000031 | 0.001 |
| 0.087550000000031 | 0.001 |
| 0.087600000000031 | 0.001 |
| 0.087650000000031 | 0.001 |
| 0.087700000000031 | 0.001 |
| 0.087750000000031 | 0 |
| 0.087800000000031 | 0 |
| 0.087850000000031 | 0 |
| 0.087900000000031 | 0 |
| 0.087950000000031 | 0 |
| 0.088000000000031 | 0 |
| 0.088050000000031 | 0 |
| 0.088100000000031 | 0 |
| 0.088150000000032 | 0 |
| 0.088200000000032 | 0 |
| 0.088250000000032 | 0 |
| 0.088300000000032 | 0 |
| 0.088350000000032 | 0 |
| 0.088400000000032 | 0 |
| 0.088450000000032 | 0 |
| 0.088500000000032 | 0 |
| 0.088550000000032 | 0 |
| 0.088600000000032 | 0 |
| 0.088650000000032 | 0 |
| 0.088700000000032 | 0 |
| 0.088750000000032 | 0 |
| 0.088800000000032 | 0 |
| 0.088850000000032 | 0 |
| 0.088900000000032 | 0 |
| 0.088950000000032 | 0 |
| 0.089000000000032 | 0 |
| 0.089050000000032 | 0 |
| 0.089100000000032 | 0 |
| 0.089150000000032 | 0 |
| 0.089200000000032 | 0 |
| 0.089250000000032 | 0 |
| 0.089300000000032 | 0 |
| 0.089350000000032 | 0 |
| 0.089400000000032 | 0 |
| 0.089450000000032 | 0 |
| 0.089500000000032 | 0 |
| 0.089550000000032 | 0 |
| 0.089600000000032 | 0 |
| 0.089650000000032 | 0 |
| 0.089700000000032 | 0 |
| 0.089750000000032 | 0 |
| 0.089800000000032 | 0.001 |
| 0.089850000000032 | 0.001 |
| 0.089900000000032 | 0.001 |
| 0.089950000000032 | 0.001 |
| 0.090000000000032 | 0.001 |
| 0.090050000000032 | 0.001 |
| 0.090100000000032 | 0.001 |
| 0.090150000000032 | 0.001 |
| 0.090200000000032 | 0.001 |
| 0.090250000000032 | 0.001 |
| 0.090300000000032 | 0.001 |
| 0.090350000000032 | 0.001 |
| 0.090400000000032 | 0.001 |
| 0.090450000000032 | 0.001 |
| 0.090500000000032 | 0.001 |
| 0.090550000000032 | 0.001 |
| 0.090600000000032 | 0.002 |
| 0.090650000000032 | 0.002 |
| 0.090700000000032 | 0.002 |
| 0.090750000000032 | 0.002 |
| 0.090800000000032 | 0.002 |
| 0.090850000000032 | 0.002 |
| 0.090900000000032 | 0.002 |
| 0.090950000000032 | 0.002 |
| 0.091000000000032 | 0.002 |
| 0.091050000000032 | 0.002 |
| 0.091100000000032 | 0.002 |
| 0.091150000000032 | 0.002 |
| 0.091200000000032 | 0.003 |
| 0.091250000000032 | 0.003 |
| 0.091300000000032 | 0.003 |
| 0.091350000000032 | 0.003 |
| 0.091400000000032 | 0.003 |
| 0.091450000000032 | 0.003 |
| 0.091500000000032 | 0.003 |
| 0.091550000000032 | 0.003 |
| 0.091600000000032 | 0.003 |
| 0.091650000000032 | 0.003 |
| 0.091700000000032 | 0.003 |
| 0.091750000000032 | 0.004 |
| 0.091800000000032 | 0.004 |
| 0.091850000000032 | 0.004 |
| 0.091900000000032 | 0.004 |
| 0.091950000000032 | 0.004 |
| 0.092000000000032 | 0.004 |
| 0.092050000000032 | 0.004 |
| 0.092100000000032 | 0.004 |
| 0.092150000000032 | 0.004 |
| 0.092200000000032 | 0.004 |
| 0.092250000000032 | 0.004 |
| 0.092300000000032 | 0.005 |
| 0.092350000000032 | 0.005 |
| 0.092400000000032 | 0.005 |
| 0.092450000000032 | 0.005 |
| 0.092500000000032 | 0.005 |
| 0.092550000000032 | 0.005 |
| 0.092600000000032 | 0.005 |
| 0.092650000000032 | 0.005 |
| 0.092700000000032 | 0.005 |
| 0.092750000000032 | 0.005 |
| 0.092800000000032 | 0.005 |
| 0.092850000000032 | 0.005 |
| 0.092900000000032 | 0.006 |
| 0.092950000000032 | 0.006 |
| 0.093000000000032 | 0.006 |
| 0.093050000000032 | 0.006 |
| 0.093100000000032 | 0.006 |
| 0.093150000000032 | 0.006 |
| 0.093200000000032 | 0.006 |
| 0.093250000000032 | 0.006 |
| 0.093300000000032 | 0.006 |
| 0.093350000000032 | 0.006 |
| 0.093400000000032 | 0.006 |
| 0.093450000000032 | 0.006 |
| 0.093500000000032 | 0.006 |
| 0.093550000000032 | 0.006 |
| 0.093600000000032 | 0.006 |
| 0.093650000000032 | 0.007 |
| 0.093700000000032 | 0.007 |
| 0.093750000000032 | 0.007 |
| 0.093800000000032 | 0.007 |
| 0.093850000000032 | 0.007 |
| 0.093900000000032 | 0.007 |
| 0.093950000000032 | 0.007 |
| 0.094000000000032 | 0.007 |
| 0.094050000000032 | 0.007 |
| 0.094100000000032 | 0.007 |
| 0.094150000000033 | 0.007 |
| 0.094200000000033 | 0.007 |
| 0.094250000000033 | 0.007 |
| 0.094300000000033 | 0.007 |
| 0.094350000000033 | 0.007 |
| 0.094400000000033 | 0.007 |
| 0.094450000000033 | 0.007 |
| 0.094500000000033 | 0.007 |
| 0.094550000000033 | 0.007 |
| 0.094600000000033 | 0.007 |
| 0.094650000000033 | 0.007 |
| 0.094700000000033 | 0.007 |
| 0.094750000000033 | 0.007 |
| 0.094800000000033 | 0.007 |
| 0.094850000000033 | 0.007 |
| 0.094900000000033 | 0.007 |
| 0.094950000000033 | 0.007 |
| 0.095000000000033 | 0.007 |
| 0.095050000000033 | 0.007 |
| 0.095100000000033 | 0.007 |
| 0.095150000000033 | 0.007 |
| 0.095200000000033 | 0.007 |
| 0.095250000000033 | 0.007 |
| 0.095300000000033 | 0.007 |
| 0.095350000000033 | 0.007 |
| 0.095400000000033 | 0.007 |
| 0.095450000000033 | 0.007 |
| 0.095500000000033 | 0.007 |
| 0.095550000000033 | 0.007 |
| 0.095600000000033 | 0.007 |
| 0.095650000000033 | 0.007 |
| 0.095700000000033 | 0.007 |
| 0.095750000000033 | 0.007 |
| 0.095800000000033 | 0.007 |
| 0.095850000000033 | 0.007 |
| 0.095900000000033 | 0.007 |
| 0.095950000000033 | 0.007 |
| 0.096000000000033 | 0.007 |
| 0.096050000000033 | 0.007 |
| 0.096100000000033 | 0.007 |
| 0.096150000000033 | 0.007 |
| 0.096200000000033 | 0.007 |
| 0.096250000000033 | 0.006 |
| 0.096300000000033 | 0.006 |
| 0.096350000000033 | 0.006 |
| 0.096400000000033 | 0.006 |
| 0.096450000000033 | 0.006 |
| 0.096500000000033 | 0.006 |
| 0.096550000000033 | 0.006 |
| 0.096600000000033 | 0.006 |
| 0.096650000000033 | 0.006 |
| 0.096700000000033 | 0.006 |
| 0.096750000000033 | 0.006 |
| 0.096800000000033 | 0.006 |
| 0.096850000000033 | 0.006 |
| 0.096900000000033 | 0.006 |
| 0.096950000000033 | 0.006 |
| 0.097000000000033 | 0.005 |
| 0.097050000000033 | 0.005 |
| 0.097100000000033 | 0.005 |
| 0.097150000000033 | 0.005 |
| 0.097200000000033 | 0.005 |
| 0.097250000000033 | 0.005 |
| 0.097300000000033 | 0.005 |
| 0.097350000000033 | 0.005 |
| 0.097400000000033 | 0.005 |
| 0.097450000000033 | 0.005 |
| 0.097500000000033 | 0.005 |
| 0.097550000000033 | 0.005 |
| 0.097600000000033 | 0.005 |
| 0.097650000000033 | 0.004 |
| 0.097700000000033 | 0.004 |
| 0.097750000000033 | 0.004 |
| 0.097800000000033 | 0.004 |
| 0.097850000000033 | 0.004 |
| 0.097900000000033 | 0.004 |
| 0.097950000000033 | 0.004 |
| 0.098000000000033 | 0.004 |
| 0.098050000000033 | 0.004 |
| 0.098100000000033 | 0.004 |
| 0.098150000000033 | 0.004 |
| 0.098200000000033 | 0.004 |
| 0.098250000000033 | 0.003 |
| 0.098300000000033 | 0.003 |
| 0.098350000000033 | 0.003 |
| 0.098400000000033 | 0.003 |
| 0.098450000000033 | 0.003 |
| 0.098500000000033 | 0.003 |
| 0.098550000000033 | 0.003 |
| 0.098600000000033 | 0.003 |
| 0.098650000000033 | 0.003 |
| 0.098700000000033 | 0.003 |
| 0.098750000000033 | 0.003 |
| 0.098800000000033 | 0.002 |
| 0.098850000000033 | 0.002 |
| 0.098900000000033 | 0.002 |
| 0.098950000000033 | 0.002 |
| 0.099000000000033 | 0.002 |
| 0.099050000000033 | 0.002 |
| 0.099100000000033 | 0.002 |
| 0.099150000000033 | 0.002 |
| 0.099200000000033 | 0.002 |
| 0.099250000000033 | 0.002 |
| 0.099300000000033 | 0.002 |
| 0.099350000000033 | 0.002 |
| 0.099400000000033 | 0.002 |
| 0.099450000000033 | 0.001 |
| 0.099500000000033 | 0.001 |
| 0.099550000000033 | 0.001 |
| 0.099600000000033 | 0.001 |
| 0.099650000000033 | 0.001 |
| 0.099700000000033 | 0.001 |
| 0.099750000000033 | 0.001 |
| 0.099800000000033 | 0.001 |
| 0.099850000000033 | 0.001 |
| 0.099900000000033 | 0.001 |
| 0.099950000000033 | 0.001 |
| 0.100000000000033 | 0.001 |